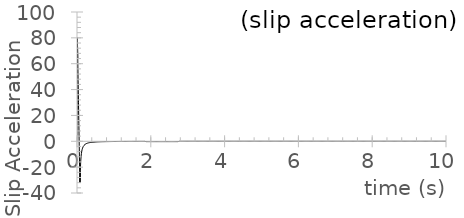
| Category | acceleration |
|---|---|
| 0.0 | 0 |
| 0.01 | 80.585 |
| 0.02 | 63.814 |
| 0.03 | 47.044 |
| 0.04 | 30.273 |
| 0.05 | 13.503 |
| 0.06 | -3.267 |
| 0.07 | -20.038 |
| 0.08 | -32.149 |
| 0.09 | -22.762 |
| 0.1 | -15.851 |
| 0.11 | -11.852 |
| 0.12 | -9.294 |
| 0.13 | -7.54 |
| 0.14 | -6.277 |
| 0.15 | -5.331 |
| 0.16 | -4.601 |
| 0.17 | -4.024 |
| 0.18 | -3.558 |
| 0.19 | -3.176 |
| 0.2 | -2.857 |
| 0.21 | -2.589 |
| 0.22 | -2.36 |
| 0.23 | -2.163 |
| 0.24 | -1.992 |
| 0.25 | -1.842 |
| 0.26 | -1.71 |
| 0.27 | -1.593 |
| 0.28 | -1.489 |
| 0.29 | -1.396 |
| 0.3 | -1.312 |
| 0.31 | -1.236 |
| 0.32 | -1.168 |
| 0.33 | -1.105 |
| 0.34 | -1.048 |
| 0.35 | -0.995 |
| 0.36 | -0.947 |
| 0.37 | -0.903 |
| 0.38 | -0.861 |
| 0.39 | -0.823 |
| 0.4 | -0.788 |
| 0.41 | -0.755 |
| 0.42 | -0.725 |
| 0.43 | -0.696 |
| 0.44 | -0.669 |
| 0.45 | -0.644 |
| 0.46 | -0.62 |
| 0.47 | -0.598 |
| 0.48 | -0.577 |
| 0.49 | -0.558 |
| 0.5 | -0.539 |
| 0.51 | -0.521 |
| 0.52 | -0.505 |
| 0.53 | -0.489 |
| 0.54 | -0.474 |
| 0.55 | -0.46 |
| 0.56 | -0.446 |
| 0.57 | -0.433 |
| 0.58 | -0.421 |
| 0.59 | -0.409 |
| 0.6 | -0.398 |
| 0.61 | -0.388 |
| 0.62 | -0.377 |
| 0.63 | -0.368 |
| 0.64 | -0.358 |
| 0.65 | -0.349 |
| 0.66 | -0.341 |
| 0.67 | -0.332 |
| 0.68 | -0.325 |
| 0.69 | -0.317 |
| 0.7 | -0.31 |
| 0.71 | -0.303 |
| 0.72 | -0.296 |
| 0.73 | -0.289 |
| 0.74 | -0.283 |
| 0.75 | -0.277 |
| 0.76 | -0.271 |
| 0.77 | -0.265 |
| 0.78 | -0.26 |
| 0.79 | -0.255 |
| 0.8 | -0.25 |
| 0.81 | -0.245 |
| 0.82 | -0.24 |
| 0.83 | -0.235 |
| 0.84 | -0.231 |
| 0.85 | -0.226 |
| 0.86 | -0.222 |
| 0.87 | -0.218 |
| 0.88 | -0.214 |
| 0.89 | -0.21 |
| 0.9 | -0.207 |
| 0.91 | -0.203 |
| 0.92 | -0.2 |
| 0.93 | -0.196 |
| 0.94 | -0.193 |
| 0.95 | -0.19 |
| 0.96 | -0.187 |
| 0.97 | -0.184 |
| 0.98 | -0.181 |
| 0.99 | -0.178 |
| 1.0 | -0.175 |
| 1.01 | -0.172 |
| 1.02 | -0.169 |
| 1.03 | -0.167 |
| 1.04 | -0.164 |
| 1.05 | -0.162 |
| 1.06 | -0.159 |
| 1.07 | -0.157 |
| 1.08 | -0.155 |
| 1.09 | -0.153 |
| 1.1 | -0.15 |
| 1.11 | -0.148 |
| 1.12 | -0.146 |
| 1.13 | -0.144 |
| 1.14 | -0.142 |
| 1.15 | -0.14 |
| 1.16 | -0.138 |
| 1.17 | -0.137 |
| 1.18 | -0.135 |
| 1.19 | -0.133 |
| 1.2 | -0.131 |
| 1.21 | -0.129 |
| 1.22 | -0.128 |
| 1.23 | -0.126 |
| 1.24 | -0.125 |
| 1.25 | -0.123 |
| 1.26 | -0.122 |
| 1.27 | -0.12 |
| 1.28 | -0.119 |
| 1.29 | -0.117 |
| 1.3 | -0.116 |
| 1.31 | -0.114 |
| 1.32 | -0.113 |
| 1.33 | -0.112 |
| 1.34 | -0.11 |
| 1.35 | -0.109 |
| 1.36 | -0.108 |
| 1.37 | -0.107 |
| 1.38 | -0.105 |
| 1.39 | -0.104 |
| 1.4 | -0.103 |
| 1.41 | -0.102 |
| 1.42 | -0.101 |
| 1.43 | -0.1 |
| 1.44 | -0.099 |
| 1.45 | -0.098 |
| 1.46 | -0.097 |
| 1.47 | -0.096 |
| 1.48 | -0.095 |
| 1.49 | -0.094 |
| 1.5 | -0.093 |
| 1.51 | -0.092 |
| 1.52 | -0.091 |
| 1.53 | -0.09 |
| 1.54 | -0.089 |
| 1.55 | -0.088 |
| 1.56 | -0.087 |
| 1.57 | -0.086 |
| 1.58 | -0.085 |
| 1.59 | -0.085 |
| 1.6 | -0.084 |
| 1.61 | -0.083 |
| 1.62 | -0.082 |
| 1.63 | -0.081 |
| 1.64 | -0.081 |
| 1.65 | -0.08 |
| 1.66 | -0.079 |
| 1.67 | -0.078 |
| 1.68 | -0.078 |
| 1.69 | -0.077 |
| 1.7 | -0.076 |
| 1.71 | -0.076 |
| 1.72 | -0.075 |
| 1.73 | -0.074 |
| 1.74 | -0.074 |
| 1.75 | -0.073 |
| 1.76 | -0.072 |
| 1.77 | -0.072 |
| 1.78 | -0.071 |
| 1.79 | -0.07 |
| 1.8 | -0.07 |
| 1.81 | -0.069 |
| 1.82 | -0.069 |
| 1.83 | -0.068 |
| 1.84 | -0.067 |
| 1.85 | -0.262 |
| 1.86 | -0.262 |
| 1.87 | -0.262 |
| 1.88 | -0.262 |
| 1.89 | -0.262 |
| 1.9 | -0.262 |
| 1.91 | -0.262 |
| 1.92 | -0.262 |
| 1.93 | -0.262 |
| 1.94 | -0.262 |
| 1.95 | -0.262 |
| 1.96 | -0.262 |
| 1.97 | -0.262 |
| 1.98 | -0.262 |
| 1.99 | -0.262 |
| 2.0 | -0.262 |
| 2.01 | -0.262 |
| 2.02 | -0.262 |
| 2.03 | -0.262 |
| 2.04 | -0.262 |
| 2.05 | -0.262 |
| 2.06 | -0.262 |
| 2.07 | -0.262 |
| 2.08 | -0.262 |
| 2.09 | -0.262 |
| 2.1 | -0.262 |
| 2.11 | -0.262 |
| 2.12 | -0.262 |
| 2.13 | -0.262 |
| 2.14 | -0.262 |
| 2.15 | -0.262 |
| 2.16 | -0.262 |
| 2.17 | -0.262 |
| 2.18 | -0.262 |
| 2.19 | -0.262 |
| 2.2 | -0.262 |
| 2.21 | -0.262 |
| 2.22 | -0.262 |
| 2.23 | -0.262 |
| 2.24 | -0.262 |
| 2.25 | -0.262 |
| 2.26 | -0.262 |
| 2.27 | -0.262 |
| 2.28 | -0.262 |
| 2.29 | -0.262 |
| 2.3 | -0.262 |
| 2.31 | -0.262 |
| 2.32 | -0.262 |
| 2.33 | -0.262 |
| 2.34 | -0.262 |
| 2.35 | -0.262 |
| 2.36 | -0.262 |
| 2.37 | -0.262 |
| 2.38 | -0.262 |
| 2.39 | -0.262 |
| 2.4 | -0.262 |
| 2.41 | -0.262 |
| 2.42 | -0.262 |
| 2.43 | -0.262 |
| 2.44 | -0.262 |
| 2.45 | -0.262 |
| 2.46 | -0.262 |
| 2.47 | -0.262 |
| 2.48 | -0.262 |
| 2.49 | -0.262 |
| 2.5 | -0.262 |
| 2.51 | -0.262 |
| 2.52 | -0.262 |
| 2.53 | -0.262 |
| 2.54 | -0.262 |
| 2.55 | -0.262 |
| 2.56 | -0.262 |
| 2.57 | -0.262 |
| 2.58 | -0.262 |
| 2.59 | -0.262 |
| 2.6 | -0.262 |
| 2.61 | -0.262 |
| 2.62 | -0.262 |
| 2.63 | -0.262 |
| 2.64 | -0.262 |
| 2.65 | -0.262 |
| 2.66 | -0.262 |
| 2.67 | -0.262 |
| 2.68 | -0.262 |
| 2.69 | -0.262 |
| 2.7 | -0.262 |
| 2.71 | -0.262 |
| 2.72 | -0.262 |
| 2.73 | -0.262 |
| 2.74 | -0.262 |
| 2.75 | -0.262 |
| 2.76 | -0.262 |
| 2.77 | 0 |
| 2.78 | 0 |
| 2.79 | 0 |
| 2.8 | 0 |
| 2.81 | 0 |
| 2.82 | 0 |
| 2.83 | 0 |
| 2.84 | 0 |
| 2.85 | 0 |
| 2.86 | 0 |
| 2.87 | 0 |
| 2.88 | 0 |
| 2.89 | 0 |
| 2.9 | 0 |
| 2.91 | 0 |
| 2.92 | 0 |
| 2.93 | 0 |
| 2.94 | 0 |
| 2.95 | 0 |
| 2.96 | 0 |
| 2.97 | 0 |
| 2.98 | 0 |
| 2.99 | 0 |
| 3.0 | 0 |
| 3.01 | 0 |
| 3.02 | 0 |
| 3.03 | 0 |
| 3.04 | 0 |
| 3.05 | 0 |
| 3.06 | 0 |
| 3.07 | 0 |
| 3.08 | 0 |
| 3.09 | 0 |
| 3.1 | 0 |
| 3.11 | 0 |
| 3.12 | 0 |
| 3.13 | 0 |
| 3.14 | 0 |
| 3.15 | 0 |
| 3.16 | 0 |
| 3.17 | 0 |
| 3.18 | 0 |
| 3.19 | 0 |
| 3.2 | 0 |
| 3.21 | 0 |
| 3.22 | 0 |
| 3.23 | 0 |
| 3.24 | 0 |
| 3.25 | 0 |
| 3.26 | 0 |
| 3.27 | 0 |
| 3.28 | 0 |
| 3.29 | 0 |
| 3.3 | 0 |
| 3.31 | 0 |
| 3.32 | 0 |
| 3.33 | 0 |
| 3.34 | 0 |
| 3.35 | 0 |
| 3.36 | 0 |
| 3.37 | 0 |
| 3.38 | 0 |
| 3.39 | 0 |
| 3.4 | 0 |
| 3.41 | 0 |
| 3.42 | 0 |
| 3.43 | 0 |
| 3.44 | 0 |
| 3.45 | 0 |
| 3.46 | 0 |
| 3.47 | 0 |
| 3.48 | 0 |
| 3.49 | 0 |
| 3.5 | 0 |
| 3.51 | 0 |
| 3.52 | 0 |
| 3.53 | 0 |
| 3.54 | 0 |
| 3.55 | 0 |
| 3.56 | 0 |
| 3.57 | 0 |
| 3.58 | 0 |
| 3.59 | 0 |
| 3.6 | 0 |
| 3.61 | 0 |
| 3.62 | 0 |
| 3.63 | 0 |
| 3.64 | 0 |
| 3.65 | 0 |
| 3.66 | 0 |
| 3.67 | 0 |
| 3.68 | 0 |
| 3.69 | 0 |
| 3.7 | 0 |
| 3.71 | 0 |
| 3.72 | 0 |
| 3.73 | 0 |
| 3.74 | 0 |
| 3.75 | 0 |
| 3.76 | 0 |
| 3.77 | 0 |
| 3.78 | 0 |
| 3.79 | 0 |
| 3.8 | 0 |
| 3.81 | 0 |
| 3.82 | 0 |
| 3.83 | 0 |
| 3.84 | 0 |
| 3.85 | 0 |
| 3.86 | 0 |
| 3.87 | 0 |
| 3.88 | 0 |
| 3.89 | 0 |
| 3.9 | 0 |
| 3.91 | 0 |
| 3.92 | 0 |
| 3.93 | 0 |
| 3.94 | 0 |
| 3.95 | 0 |
| 3.96 | 0 |
| 3.97 | 0 |
| 3.98 | 0 |
| 3.99 | 0 |
| 4.0 | 0 |
| 4.01 | 0 |
| 4.02 | 0 |
| 4.03 | 0 |
| 4.04 | 0 |
| 4.05 | 0 |
| 4.06 | 0 |
| 4.07 | 0 |
| 4.08 | 0 |
| 4.09 | 0 |
| 4.1 | 0 |
| 4.11 | 0 |
| 4.12 | 0 |
| 4.13 | 0 |
| 4.14 | 0 |
| 4.15 | 0 |
| 4.16 | 0 |
| 4.17 | 0 |
| 4.18 | 0 |
| 4.19 | 0 |
| 4.2 | 0 |
| 4.21 | 0 |
| 4.22 | 0 |
| 4.23 | 0 |
| 4.24 | 0 |
| 4.25 | 0 |
| 4.26 | 0 |
| 4.27 | 0 |
| 4.28 | 0 |
| 4.29 | 0 |
| 4.3 | 0 |
| 4.31 | 0 |
| 4.32 | 0 |
| 4.33 | 0 |
| 4.34 | 0 |
| 4.35 | 0 |
| 4.36 | 0 |
| 4.37 | 0 |
| 4.38 | 0 |
| 4.39 | 0 |
| 4.4 | 0 |
| 4.41 | 0 |
| 4.42 | 0 |
| 4.43 | 0 |
| 4.44 | 0 |
| 4.45 | 0 |
| 4.46 | 0 |
| 4.47 | 0 |
| 4.48 | 0 |
| 4.49 | 0 |
| 4.5 | 0 |
| 4.51 | 0 |
| 4.52 | 0 |
| 4.53 | 0 |
| 4.54 | 0 |
| 4.55 | 0 |
| 4.56 | 0 |
| 4.57 | 0 |
| 4.58 | 0 |
| 4.59 | 0 |
| 4.6 | 0 |
| 4.61 | 0 |
| 4.62 | 0 |
| 4.63 | 0 |
| 4.64 | 0 |
| 4.65 | 0 |
| 4.66 | 0 |
| 4.67 | 0 |
| 4.68 | 0 |
| 4.69 | 0 |
| 4.7 | 0 |
| 4.71 | 0 |
| 4.72 | 0 |
| 4.73 | 0 |
| 4.74 | 0 |
| 4.75 | 0 |
| 4.76 | 0 |
| 4.77 | 0 |
| 4.78 | 0 |
| 4.79 | 0 |
| 4.8 | 0 |
| 4.81 | 0 |
| 4.82 | 0 |
| 4.83 | 0 |
| 4.84 | 0 |
| 4.85 | 0 |
| 4.86 | 0 |
| 4.87 | 0 |
| 4.88 | 0 |
| 4.89 | 0 |
| 4.9 | 0 |
| 4.91 | 0 |
| 4.92 | 0 |
| 4.93 | 0 |
| 4.94 | 0 |
| 4.95 | 0 |
| 4.96 | 0 |
| 4.97 | 0 |
| 4.98 | 0 |
| 4.99 | 0 |
| 5.0 | 0 |
| 5.01 | 0 |
| 5.02 | 0 |
| 5.03 | 0 |
| 5.04 | 0 |
| 5.05 | 0 |
| 5.06 | 0 |
| 5.07 | 0 |
| 5.08 | 0 |
| 5.09 | 0 |
| 5.1 | 0 |
| 5.11 | 0 |
| 5.12 | 0 |
| 5.13 | 0 |
| 5.14 | 0 |
| 5.15 | 0 |
| 5.16 | 0 |
| 5.17 | 0 |
| 5.18 | 0 |
| 5.19 | 0 |
| 5.2 | 0 |
| 5.21 | 0 |
| 5.22 | 0 |
| 5.23 | 0 |
| 5.24 | 0 |
| 5.25 | 0 |
| 5.26 | 0 |
| 5.27 | 0 |
| 5.28 | 0 |
| 5.29 | 0 |
| 5.3 | 0 |
| 5.31 | 0 |
| 5.32 | 0 |
| 5.33 | 0 |
| 5.34 | 0 |
| 5.35 | 0 |
| 5.36 | 0 |
| 5.37 | 0 |
| 5.38 | 0 |
| 5.39 | 0 |
| 5.4 | 0 |
| 5.41 | 0 |
| 5.42 | 0 |
| 5.43 | 0 |
| 5.44 | 0 |
| 5.45 | 0 |
| 5.46 | 0 |
| 5.47 | 0 |
| 5.48 | 0 |
| 5.49 | 0 |
| 5.5 | 0 |
| 5.51 | 0 |
| 5.52 | 0 |
| 5.53 | 0 |
| 5.54 | 0 |
| 5.55 | 0 |
| 5.56 | 0 |
| 5.57 | 0 |
| 5.58 | 0 |
| 5.59 | 0 |
| 5.6 | 0 |
| 5.61 | 0 |
| 5.62 | 0 |
| 5.63 | 0 |
| 5.64 | 0 |
| 5.65 | 0 |
| 5.66 | 0 |
| 5.67 | 0 |
| 5.68 | 0 |
| 5.69 | 0 |
| 5.7 | 0 |
| 5.71 | 0 |
| 5.72 | 0 |
| 5.73 | 0 |
| 5.74 | 0 |
| 5.75 | 0 |
| 5.76 | 0 |
| 5.77 | 0 |
| 5.78 | 0 |
| 5.79 | 0 |
| 5.8 | 0 |
| 5.81 | 0 |
| 5.82 | 0 |
| 5.83 | 0 |
| 5.84 | 0 |
| 5.85 | 0 |
| 5.86 | 0 |
| 5.87 | 0 |
| 5.88 | 0 |
| 5.89 | 0 |
| 5.9 | 0 |
| 5.91 | 0 |
| 5.92 | 0 |
| 5.93 | 0 |
| 5.94 | 0 |
| 5.95 | 0 |
| 5.96 | 0 |
| 5.97 | 0 |
| 5.98 | 0 |
| 5.99 | 0 |
| 6.0 | 0 |
| 6.01 | 0 |
| 6.02 | 0 |
| 6.03 | 0 |
| 6.04 | 0 |
| 6.05 | 0 |
| 6.06 | 0 |
| 6.07 | 0 |
| 6.08 | 0 |
| 6.09 | 0 |
| 6.1 | 0 |
| 6.11 | 0 |
| 6.12 | 0 |
| 6.13 | 0 |
| 6.14 | 0 |
| 6.15 | 0 |
| 6.16 | 0 |
| 6.17 | 0 |
| 6.18 | 0 |
| 6.19 | 0 |
| 6.2 | 0 |
| 6.21 | 0 |
| 6.22 | 0 |
| 6.23 | 0 |
| 6.24 | 0 |
| 6.25 | 0 |
| 6.26 | 0 |
| 6.27 | 0 |
| 6.28 | 0 |
| 6.29 | 0 |
| 6.3 | 0 |
| 6.31 | 0 |
| 6.32 | 0 |
| 6.33 | 0 |
| 6.34 | 0 |
| 6.35 | 0 |
| 6.36 | 0 |
| 6.37 | 0 |
| 6.38 | 0 |
| 6.39 | 0 |
| 6.4 | 0 |
| 6.41 | 0 |
| 6.42 | 0 |
| 6.43 | 0 |
| 6.44 | 0 |
| 6.45 | 0 |
| 6.46 | 0 |
| 6.47 | 0 |
| 6.48 | 0 |
| 6.49 | 0 |
| 6.5 | 0 |
| 6.51 | 0 |
| 6.52 | 0 |
| 6.53 | 0 |
| 6.54 | 0 |
| 6.55 | 0 |
| 6.56 | 0 |
| 6.57 | 0 |
| 6.58 | 0 |
| 6.59 | 0 |
| 6.6 | 0 |
| 6.61 | 0 |
| 6.62 | 0 |
| 6.63 | 0 |
| 6.64 | 0 |
| 6.65 | 0 |
| 6.66 | 0 |
| 6.67 | 0 |
| 6.68 | 0 |
| 6.69 | 0 |
| 6.7 | 0 |
| 6.71 | 0 |
| 6.72 | 0 |
| 6.73 | 0 |
| 6.74 | 0 |
| 6.75 | 0 |
| 6.76 | 0 |
| 6.77 | 0 |
| 6.78 | 0 |
| 6.79 | 0 |
| 6.8 | 0 |
| 6.81 | 0 |
| 6.82 | 0 |
| 6.83 | 0 |
| 6.84 | 0 |
| 6.85 | 0 |
| 6.86 | 0 |
| 6.87 | 0 |
| 6.88 | 0 |
| 6.89 | 0 |
| 6.9 | 0 |
| 6.91 | 0 |
| 6.92 | 0 |
| 6.93 | 0 |
| 6.94 | 0 |
| 6.95 | 0 |
| 6.96 | 0 |
| 6.97 | 0 |
| 6.98 | 0 |
| 6.99 | 0 |
| 7.0 | 0 |
| 7.01 | 0 |
| 7.02 | 0 |
| 7.03 | 0 |
| 7.04 | 0 |
| 7.05 | 0 |
| 7.06 | 0 |
| 7.07 | 0 |
| 7.08 | 0 |
| 7.09 | 0 |
| 7.1 | 0 |
| 7.11 | 0 |
| 7.12 | 0 |
| 7.13 | 0 |
| 7.14 | 0 |
| 7.15 | 0 |
| 7.16 | 0 |
| 7.17 | 0 |
| 7.18 | 0 |
| 7.19 | 0 |
| 7.2 | 0 |
| 7.21 | 0 |
| 7.22 | 0 |
| 7.23 | 0 |
| 7.24 | 0 |
| 7.25 | 0 |
| 7.26 | 0 |
| 7.27 | 0 |
| 7.28 | 0 |
| 7.29 | 0 |
| 7.3 | 0 |
| 7.31 | 0 |
| 7.32 | 0 |
| 7.33 | 0 |
| 7.34 | 0 |
| 7.35 | 0 |
| 7.36 | 0 |
| 7.37 | 0 |
| 7.38 | 0 |
| 7.39 | 0 |
| 7.4 | 0 |
| 7.41 | 0 |
| 7.42 | 0 |
| 7.43 | 0 |
| 7.44 | 0 |
| 7.45 | 0 |
| 7.46 | 0 |
| 7.47 | 0 |
| 7.48 | 0 |
| 7.49 | 0 |
| 7.5 | 0 |
| 7.51 | 0 |
| 7.52 | 0 |
| 7.53 | 0 |
| 7.54 | 0 |
| 7.55 | 0 |
| 7.56 | 0 |
| 7.57 | 0 |
| 7.58 | 0 |
| 7.59 | 0 |
| 7.6 | 0 |
| 7.61 | 0 |
| 7.62 | 0 |
| 7.63 | 0 |
| 7.64 | 0 |
| 7.65 | 0 |
| 7.66 | 0 |
| 7.67 | 0 |
| 7.68 | 0 |
| 7.69 | 0 |
| 7.7 | 0 |
| 7.71 | 0 |
| 7.72 | 0 |
| 7.73 | 0 |
| 7.74 | 0 |
| 7.75 | 0 |
| 7.76 | 0 |
| 7.77 | 0 |
| 7.78 | 0 |
| 7.79 | 0 |
| 7.8 | 0 |
| 7.81 | 0 |
| 7.82 | 0 |
| 7.83 | 0 |
| 7.84 | 0 |
| 7.85 | 0 |
| 7.86 | 0 |
| 7.87 | 0 |
| 7.88 | 0 |
| 7.89 | 0 |
| 7.9 | 0 |
| 7.91 | 0 |
| 7.92 | 0 |
| 7.93 | 0 |
| 7.94 | 0 |
| 7.95 | 0 |
| 7.96 | 0 |
| 7.97 | 0 |
| 7.98 | 0 |
| 7.99 | 0 |
| 8.0 | 0 |
| 8.01 | 0 |
| 8.02 | 0 |
| 8.03 | 0 |
| 8.04 | 0 |
| 8.05 | 0 |
| 8.06 | 0 |
| 8.07 | 0 |
| 8.08 | 0 |
| 8.09 | 0 |
| 8.1 | 0 |
| 8.11 | 0 |
| 8.12 | 0 |
| 8.13 | 0 |
| 8.14 | 0 |
| 8.15 | 0 |
| 8.16 | 0 |
| 8.17 | 0 |
| 8.18 | 0 |
| 8.19 | 0 |
| 8.2 | 0 |
| 8.21 | 0 |
| 8.22 | 0 |
| 8.23 | 0 |
| 8.24 | 0 |
| 8.25 | 0 |
| 8.26 | 0 |
| 8.27 | 0 |
| 8.28 | 0 |
| 8.29 | 0 |
| 8.3 | 0 |
| 8.31 | 0 |
| 8.32 | 0 |
| 8.33 | 0 |
| 8.34 | 0 |
| 8.35 | 0 |
| 8.36 | 0 |
| 8.37 | 0 |
| 8.38 | 0 |
| 8.39 | 0 |
| 8.4 | 0 |
| 8.41 | 0 |
| 8.42 | 0 |
| 8.43 | 0 |
| 8.44 | 0 |
| 8.45 | 0 |
| 8.46 | 0 |
| 8.47 | 0 |
| 8.48 | 0 |
| 8.49 | 0 |
| 8.5 | 0 |
| 8.51 | 0 |
| 8.52 | 0 |
| 8.53 | 0 |
| 8.54 | 0 |
| 8.55 | 0 |
| 8.56 | 0 |
| 8.57 | 0 |
| 8.58 | 0 |
| 8.59 | 0 |
| 8.6 | 0 |
| 8.61 | 0 |
| 8.62 | 0 |
| 8.63 | 0 |
| 8.64 | 0 |
| 8.65 | 0 |
| 8.66 | 0 |
| 8.67 | 0 |
| 8.68 | 0 |
| 8.69 | 0 |
| 8.7 | 0 |
| 8.71 | 0 |
| 8.72 | 0 |
| 8.73 | 0 |
| 8.74 | 0 |
| 8.75 | 0 |
| 8.76 | 0 |
| 8.77 | 0 |
| 8.78 | 0 |
| 8.79 | 0 |
| 8.8 | 0 |
| 8.81 | 0 |
| 8.82 | 0 |
| 8.83 | 0 |
| 8.84 | 0 |
| 8.85 | 0 |
| 8.86 | 0 |
| 8.87 | 0 |
| 8.88 | 0 |
| 8.89 | 0 |
| 8.9 | 0 |
| 8.91 | 0 |
| 8.92 | 0 |
| 8.93 | 0 |
| 8.94 | 0 |
| 8.95 | 0 |
| 8.96 | 0 |
| 8.97 | 0 |
| 8.98 | 0 |
| 8.99 | 0 |
| 9.0 | 0 |
| 9.01 | 0 |
| 9.02 | 0 |
| 9.03 | 0 |
| 9.04 | 0 |
| 9.05 | 0 |
| 9.06 | 0 |
| 9.07 | 0 |
| 9.08 | 0 |
| 9.09 | 0 |
| 9.1 | 0 |
| 9.11 | 0 |
| 9.12 | 0 |
| 9.13 | 0 |
| 9.14 | 0 |
| 9.15 | 0 |
| 9.16 | 0 |
| 9.17 | 0 |
| 9.18 | 0 |
| 9.19 | 0 |
| 9.2 | 0 |
| 9.21 | 0 |
| 9.22 | 0 |
| 9.23 | 0 |
| 9.24 | 0 |
| 9.25 | 0 |
| 9.26 | 0 |
| 9.27 | 0 |
| 9.28 | 0 |
| 9.29 | 0 |
| 9.3 | 0 |
| 9.31 | 0 |
| 9.32 | 0 |
| 9.33 | 0 |
| 9.34 | 0 |
| 9.35 | 0 |
| 9.36 | 0 |
| 9.37 | 0 |
| 9.38 | 0 |
| 9.39 | 0 |
| 9.4 | 0 |
| 9.41 | 0 |
| 9.42 | 0 |
| 9.43 | 0 |
| 9.44 | 0 |
| 9.45 | 0 |
| 9.46 | 0 |
| 9.47 | 0 |
| 9.48 | 0 |
| 9.49 | 0 |
| 9.5 | 0 |
| 9.51 | 0 |
| 9.52 | 0 |
| 9.53 | 0 |
| 9.54 | 0 |
| 9.55 | 0 |
| 9.56 | 0 |
| 9.57 | 0 |
| 9.58 | 0 |
| 9.59 | 0 |
| 9.6 | 0 |
| 9.61 | 0 |
| 9.62 | 0 |
| 9.63 | 0 |
| 9.64 | 0 |
| 9.65 | 0 |
| 9.66 | 0 |
| 9.67 | 0 |
| 9.68 | 0 |
| 9.69 | 0 |
| 9.7 | 0 |
| 9.71 | 0 |
| 9.72 | 0 |
| 9.73 | 0 |
| 9.74 | 0 |
| 9.75 | 0 |
| 9.76 | 0 |
| 9.77 | 0 |
| 9.78 | 0 |
| 9.79 | 0 |
| 9.8 | 0 |
| 9.81 | 0 |
| 9.82 | 0 |
| 9.83 | 0 |
| 9.84 | 0 |
| 9.85 | 0 |
| 9.86 | 0 |
| 9.87 | 0 |
| 9.88 | 0 |
| 9.89 | 0 |
| 9.9 | 0 |
| 9.91 | 0 |
| 9.92 | 0 |
| 9.93 | 0 |
| 9.94 | 0 |
| 9.95 | 0 |
| 9.96 | 0 |
| 9.97 | 0 |
| 9.98 | 0 |
| 9.99 | 0 |
| 10.0 | 0 |
| 10.01 | 0 |
| 10.02 | 0 |
| 10.03 | 0 |
| 10.04 | 0 |
| 10.05 | 0 |
| 10.06 | 0 |
| 10.07 | 0 |
| 10.08 | 0 |
| 10.09 | 0 |
| 10.1 | 0 |
| 10.11 | 0 |
| 10.12 | 0 |
| 10.13 | 0 |
| 10.14 | 0 |
| 10.15 | 0 |
| 10.16 | 0 |
| 10.17 | 0 |
| 10.18 | 0 |
| 10.19 | 0 |
| 10.2 | 0 |
| 10.21 | 0 |
| 10.22 | 0 |
| 10.23 | 0 |
| 10.24 | 0 |
| 10.25 | 0 |
| 10.26 | 0 |
| 10.27 | 0 |
| 10.28 | 0 |
| 10.29 | 0 |
| 10.3 | 0 |
| 10.31 | 0 |
| 10.32 | 0 |
| 10.33 | 0 |
| 10.34 | 0 |
| 10.35 | 0 |
| 10.36 | 0 |
| 10.37 | 0 |
| 10.38 | 0 |
| 10.39 | 0 |
| 10.4 | 0 |
| 10.41 | 0 |
| 10.42 | 0 |
| 10.43 | 0 |
| 10.44 | 0 |
| 10.45 | 0 |
| 10.46 | 0 |
| 10.47 | 0 |
| 10.48 | 0 |
| 10.49 | 0 |
| 10.5 | 0 |
| 10.51 | 0 |
| 10.52 | 0 |
| 10.53 | 0 |
| 10.54 | 0 |
| 10.55 | 0 |
| 10.56 | 0 |
| 10.57 | 0 |
| 10.58 | 0 |
| 10.59 | 0 |
| 10.6 | 0 |
| 10.61 | 0 |
| 10.62 | 0 |
| 10.63 | 0 |
| 10.64 | 0 |
| 10.65 | 0 |
| 10.66 | 0 |
| 10.67 | 0 |
| 10.68 | 0 |
| 10.69 | 0 |
| 10.7 | 0 |
| 10.71 | 0 |
| 10.72 | 0 |
| 10.73 | 0 |
| 10.74 | 0 |
| 10.75 | 0 |
| 10.76 | 0 |
| 10.77 | 0 |
| 10.78 | 0 |
| 10.79 | 0 |
| 10.8 | 0 |
| 10.81 | 0 |
| 10.82 | 0 |
| 10.83 | 0 |
| 10.84 | 0 |
| 10.85 | 0 |
| 10.86 | 0 |
| 10.87 | 0 |
| 10.88 | 0 |
| 10.89 | 0 |
| 10.9 | 0 |
| 10.91 | 0 |
| 10.92 | 0 |
| 10.93 | 0 |
| 10.94 | 0 |
| 10.95 | 0 |
| 10.96 | 0 |
| 10.97 | 0 |
| 10.98 | 0 |
| 10.99 | 0 |
| 11.0 | 0 |
| 11.01 | 0 |
| 11.02 | 0 |
| 11.03 | 0 |
| 11.04 | 0 |
| 11.05 | 0 |
| 11.06 | 0 |
| 11.07 | 0 |
| 11.08 | 0 |
| 11.09 | 0 |
| 11.1 | 0 |
| 11.11 | 0 |
| 11.12 | 0 |
| 11.13 | 0 |
| 11.14 | 0 |
| 11.15 | 0 |
| 11.16 | 0 |
| 11.17 | 0 |
| 11.18 | 0 |
| 11.19 | 0 |
| 11.2 | 0 |
| 11.21 | 0 |
| 11.22 | 0 |
| 11.23 | 0 |
| 11.24 | 0 |
| 11.25 | 0 |
| 11.26 | 0 |
| 11.27 | 0 |
| 11.28 | 0 |
| 11.29 | 0 |
| 11.3 | 0 |
| 11.31 | 0 |
| 11.32 | 0 |
| 11.33 | 0 |
| 11.34 | 0 |
| 11.35 | 0 |
| 11.36 | 0 |
| 11.37 | 0 |
| 11.38 | 0 |
| 11.39 | 0 |
| 11.4 | 0 |
| 11.41 | 0 |
| 11.42 | 0 |
| 11.43 | 0 |
| 11.44 | 0 |
| 11.45 | 0 |
| 11.46 | 0 |
| 11.47 | 0 |
| 11.48 | 0 |
| 11.49 | 0 |
| 11.5 | 0 |
| 11.51 | 0 |
| 11.52 | 0 |
| 11.53 | 0 |
| 11.54 | 0 |
| 11.55 | 0 |
| 11.56 | 0 |
| 11.57 | 0 |
| 11.58 | 0 |
| 11.59 | 0 |
| 11.6 | 0 |
| 11.61 | 0 |
| 11.62 | 0 |
| 11.63 | 0 |
| 11.64 | 0 |
| 11.65 | 0 |
| 11.66 | 0 |
| 11.67 | 0 |
| 11.68 | 0 |
| 11.69 | 0 |
| 11.7 | 0 |
| 11.71 | 0 |
| 11.72 | 0 |
| 11.73 | 0 |
| 11.74 | 0 |
| 11.75 | 0 |
| 11.76 | 0 |
| 11.77 | 0 |
| 11.78 | 0 |
| 11.79 | 0 |
| 11.8 | 0 |
| 11.81 | 0 |
| 11.82 | 0 |
| 11.83 | 0 |
| 11.84 | 0 |
| 11.85 | 0 |
| 11.86 | 0 |
| 11.87 | 0 |
| 11.88 | 0 |
| 11.89 | 0 |
| 11.9 | 0 |
| 11.91 | 0 |
| 11.92 | 0 |
| 11.93 | 0 |
| 11.94 | 0 |
| 11.95 | 0 |
| 11.96 | 0 |
| 11.97 | 0 |
| 11.98 | 0 |
| 11.99 | 0 |
| 12.0 | 0 |
| 12.01 | 0 |
| 12.02 | 0 |
| 12.03 | 0 |
| 12.04 | 0 |
| 12.05 | 0 |
| 12.06 | 0 |
| 12.07 | 0 |
| 12.08 | 0 |
| 12.09 | 0 |
| 12.1 | 0 |
| 12.11 | 0 |
| 12.12 | 0 |
| 12.13 | 0 |
| 12.14 | 0 |
| 12.15 | 0 |
| 12.16 | 0 |
| 12.17 | 0 |
| 12.18 | 0 |
| 12.19 | 0 |
| 12.2 | 0 |
| 12.21 | 0 |
| 12.22 | 0 |
| 12.23 | 0 |
| 12.24 | 0 |
| 12.25 | 0 |
| 12.26 | 0 |
| 12.27 | 0 |
| 12.28 | 0 |
| 12.29 | 0 |
| 12.3 | 0 |
| 12.31 | 0 |
| 12.32 | 0 |
| 12.33 | 0 |
| 12.34 | 0 |
| 12.35 | 0 |
| 12.36 | 0 |
| 12.37 | 0 |
| 12.38 | 0 |
| 12.39 | 0 |
| 12.4 | 0 |
| 12.41 | 0 |
| 12.42 | 0 |
| 12.43 | 0 |
| 12.44 | 0 |
| 12.45 | 0 |
| 12.46 | 0 |
| 12.47 | 0 |
| 12.48 | 0 |
| 12.49 | 0 |
| 12.5 | 0 |
| 12.51 | 0 |
| 12.52 | 0 |
| 12.53 | 0 |
| 12.54 | 0 |
| 12.55 | 0 |
| 12.56 | 0 |
| 12.57 | 0 |
| 12.58 | 0 |
| 12.59 | 0 |
| 12.6 | 0 |
| 12.61 | 0 |
| 12.62 | 0 |
| 12.63 | 0 |
| 12.64 | 0 |
| 12.65 | 0 |
| 12.66 | 0 |
| 12.67 | 0 |
| 12.68 | 0 |
| 12.69 | 0 |
| 12.7 | 0 |
| 12.71 | 0 |
| 12.72 | 0 |
| 12.73 | 0 |
| 12.74 | 0 |
| 12.75 | 0 |
| 12.76 | 0 |
| 12.77 | 0 |
| 12.78 | 0 |
| 12.79 | 0 |
| 12.8 | 0 |
| 12.81 | 0 |
| 12.82 | 0 |
| 12.83 | 0 |
| 12.84 | 0 |
| 12.85 | 0 |
| 12.86 | 0 |
| 12.87 | 0 |
| 12.88 | 0 |
| 12.89 | 0 |
| 12.9 | 0 |
| 12.91 | 0 |
| 12.92 | 0 |
| 12.93 | 0 |
| 12.94 | 0 |
| 12.95 | 0 |
| 12.96 | 0 |
| 12.97 | 0 |
| 12.98 | 0 |
| 12.99 | 0 |
| 13.0 | 0 |
| 13.01 | 0 |
| 13.02 | 0 |
| 13.03 | 0 |
| 13.04 | 0 |
| 13.05 | 0 |
| 13.06 | 0 |
| 13.07 | 0 |
| 13.08 | 0 |
| 13.09 | 0 |
| 13.1 | 0 |
| 13.11 | 0 |
| 13.12 | 0 |
| 13.13 | 0 |
| 13.14 | 0 |
| 13.15 | 0 |
| 13.16 | 0 |
| 13.17 | 0 |
| 13.18 | 0 |
| 13.19 | 0 |
| 13.2 | 0 |
| 13.21 | 0 |
| 13.22 | 0 |
| 13.23 | 0 |
| 13.24 | 0 |
| 13.25 | 0 |
| 13.26 | 0 |
| 13.27 | 0 |
| 13.28 | 0 |
| 13.29 | 0 |
| 13.3 | 0 |
| 13.31 | 0 |
| 13.32 | 0 |
| 13.33 | 0 |
| 13.34 | 0 |
| 13.35 | 0 |
| 13.36 | 0 |
| 13.37 | 0 |
| 13.38 | 0 |
| 13.39 | 0 |
| 13.4 | 0 |
| 13.41 | 0 |
| 13.42 | 0 |
| 13.43 | 0 |
| 13.44 | 0 |
| 13.45 | 0 |
| 13.46 | 0 |
| 13.47 | 0 |
| 13.48 | 0 |
| 13.49 | 0 |
| 13.5 | 0 |
| 13.51 | 0 |
| 13.52 | 0 |
| 13.53 | 0 |
| 13.54 | 0 |
| 13.55 | 0 |
| 13.56 | 0 |
| 13.57 | 0 |
| 13.58 | 0 |
| 13.59 | 0 |
| 13.6 | 0 |
| 13.61 | 0 |
| 13.62 | 0 |
| 13.63 | 0 |
| 13.64 | 0 |
| 13.65 | 0 |
| 13.66 | 0 |
| 13.67 | 0 |
| 13.68 | 0 |
| 13.69 | 0 |
| 13.7 | 0 |
| 13.71 | 0 |
| 13.72 | 0 |
| 13.73 | 0 |
| 13.74 | 0 |
| 13.75 | 0 |
| 13.76 | 0 |
| 13.77 | 0 |
| 13.78 | 0 |
| 13.79 | 0 |
| 13.8 | 0 |
| 13.81 | 0 |
| 13.82 | 0 |
| 13.83 | 0 |
| 13.84 | 0 |
| 13.85 | 0 |
| 13.86 | 0 |
| 13.87 | 0 |
| 13.88 | 0 |
| 13.89 | 0 |
| 13.9 | 0 |
| 13.91 | 0 |
| 13.92 | 0 |
| 13.93 | 0 |
| 13.94 | 0 |
| 13.95 | 0 |
| 13.96 | 0 |
| 13.97 | 0 |
| 13.98 | 0 |
| 13.99 | 0 |
| 14.0 | 0 |
| 14.01 | 0 |
| 14.02 | 0 |
| 14.03 | 0 |
| 14.04 | 0 |
| 14.05 | 0 |
| 14.06 | 0 |
| 14.07 | 0 |
| 14.08 | 0 |
| 14.09 | 0 |
| 14.1 | 0 |
| 14.11 | 0 |
| 14.12 | 0 |
| 14.13 | 0 |
| 14.14 | 0 |
| 14.15 | 0 |
| 14.16 | 0 |
| 14.17 | 0 |
| 14.18 | 0 |
| 14.19 | 0 |
| 14.2 | 0 |
| 14.21 | 0 |
| 14.22 | 0 |
| 14.23 | 0 |
| 14.24 | 0 |
| 14.25 | 0 |
| 14.26 | 0 |
| 14.27 | 0 |
| 14.28 | 0 |
| 14.29 | 0 |
| 14.3 | 0 |
| 14.31 | 0 |
| 14.32 | 0 |
| 14.33 | 0 |
| 14.34 | 0 |
| 14.35 | 0 |
| 14.36 | 0 |
| 14.37 | 0 |
| 14.38 | 0 |
| 14.39 | 0 |
| 14.4 | 0 |
| 14.41 | 0 |
| 14.42 | 0 |
| 14.43 | 0 |
| 14.44 | 0 |
| 14.45 | 0 |
| 14.46 | 0 |
| 14.47 | 0 |
| 14.48 | 0 |
| 14.49 | 0 |
| 14.5 | 0 |
| 14.51 | 0 |
| 14.52 | 0 |
| 14.53 | 0 |
| 14.54 | 0 |
| 14.55 | 0 |
| 14.56 | 0 |
| 14.57 | 0 |
| 14.58 | 0 |
| 14.59 | 0 |
| 14.6 | 0 |
| 14.61 | 0 |
| 14.62 | 0 |
| 14.63 | 0 |
| 14.64 | 0 |
| 14.65 | 0 |
| 14.66 | 0 |
| 14.67 | 0 |
| 14.68 | 0 |
| 14.69 | 0 |
| 14.7 | 0 |
| 14.71 | 0 |
| 14.72 | 0 |
| 14.73 | 0 |
| 14.74 | 0 |
| 14.75 | 0 |
| 14.76 | 0 |
| 14.77 | 0 |
| 14.78 | 0 |
| 14.79 | 0 |
| 14.8 | 0 |
| 14.81 | 0 |
| 14.82 | 0 |
| 14.83 | 0 |
| 14.84 | 0 |
| 14.85 | 0 |
| 14.86 | 0 |
| 14.87 | 0 |
| 14.88 | 0 |
| 14.89 | 0 |
| 14.9 | 0 |
| 14.91 | 0 |
| 14.92 | 0 |
| 14.93 | 0 |
| 14.94 | 0 |
| 14.95 | 0 |
| 14.96 | 0 |
| 14.97 | 0 |
| 14.98 | 0 |
| 14.99 | 0 |
| 15.0 | 0 |
| 15.01 | 0 |
| 15.02 | 0 |
| 15.03 | 0 |
| 15.04 | 0 |
| 15.05 | 0 |
| 15.06 | 0 |
| 15.07 | 0 |
| 15.08 | 0 |
| 15.09 | 0 |
| 15.1 | 0 |
| 15.11 | 0 |
| 15.12 | 0 |
| 15.13 | 0 |
| 15.14 | 0 |
| 15.15 | 0 |
| 15.16 | 0 |
| 15.17 | 0 |
| 15.18 | 0 |
| 15.19 | 0 |
| 15.2 | 0 |
| 15.21 | 0 |
| 15.22 | 0 |
| 15.23 | 0 |
| 15.24 | 0 |
| 15.25 | 0 |
| 15.26 | 0 |
| 15.27 | 0 |
| 15.28 | 0 |
| 15.29 | 0 |
| 15.3 | 0 |
| 15.31 | 0 |
| 15.32 | 0 |
| 15.33 | 0 |
| 15.34 | 0 |
| 15.35 | 0 |
| 15.36 | 0 |
| 15.37 | 0 |
| 15.38 | 0 |
| 15.39 | 0 |
| 15.4 | 0 |
| 15.41 | 0 |
| 15.42 | 0 |
| 15.43 | 0 |
| 15.44 | 0 |
| 15.45 | 0 |
| 15.46 | 0 |
| 15.47 | 0 |
| 15.48 | 0 |
| 15.49 | 0 |
| 15.5 | 0 |
| 15.51 | 0 |
| 15.52 | 0 |
| 15.53 | 0 |
| 15.54 | 0 |
| 15.55 | 0 |
| 15.56 | 0 |
| 15.57 | 0 |
| 15.58 | 0 |
| 15.59 | 0 |
| 15.6 | 0 |
| 15.61 | 0 |
| 15.62 | 0 |
| 15.63 | 0 |
| 15.64 | 0 |
| 15.65 | 0 |
| 15.66 | 0 |
| 15.67 | 0 |
| 15.68 | 0 |
| 15.69 | 0 |
| 15.7 | 0 |
| 15.71 | 0 |
| 15.72 | 0 |
| 15.73 | 0 |
| 15.74 | 0 |
| 15.75 | 0 |
| 15.76 | 0 |
| 15.77 | 0 |
| 15.78 | 0 |
| 15.79 | 0 |
| 15.8 | 0 |
| 15.81 | 0 |
| 15.82 | 0 |
| 15.83 | 0 |
| 15.84 | 0 |
| 15.85 | 0 |
| 15.86 | 0 |
| 15.87 | 0 |
| 15.88 | 0 |
| 15.89 | 0 |
| 15.9 | 0 |
| 15.91 | 0 |
| 15.92 | 0 |
| 15.93 | 0 |
| 15.94 | 0 |
| 15.95 | 0 |
| 15.96 | 0 |
| 15.97 | 0 |
| 15.98 | 0 |
| 15.99 | 0 |
| 16.0 | 0 |
| 16.01 | 0 |
| 16.02 | 0 |
| 16.03 | 0 |
| 16.04 | 0 |
| 16.05 | 0 |
| 16.06 | 0 |
| 16.07 | 0 |
| 16.08 | 0 |
| 16.09 | 0 |
| 16.1 | 0 |
| 16.11 | 0 |
| 16.12 | 0 |
| 16.13 | 0 |
| 16.14 | 0 |
| 16.15 | 0 |
| 16.16 | 0 |
| 16.17 | 0 |
| 16.18 | 0 |
| 16.19 | 0 |
| 16.2 | 0 |
| 16.21 | 0 |
| 16.22 | 0 |
| 16.23 | 0 |
| 16.24 | 0 |
| 16.25 | 0 |
| 16.26 | 0 |
| 16.27 | 0 |
| 16.28 | 0 |
| 16.29 | 0 |
| 16.3 | 0 |
| 16.31 | 0 |
| 16.32 | 0 |
| 16.33 | 0 |
| 16.34 | 0 |
| 16.35 | 0 |
| 16.36 | 0 |
| 16.37 | 0 |
| 16.38 | 0 |
| 16.39 | 0 |
| 16.4 | 0 |
| 16.41 | 0 |
| 16.42 | 0 |
| 16.43 | 0 |
| 16.44 | 0 |
| 16.45 | 0 |
| 16.46 | 0 |
| 16.47 | 0 |
| 16.48 | 0 |
| 16.49 | 0 |
| 16.5 | 0 |
| 16.51 | 0 |
| 16.52 | 0 |
| 16.53 | 0 |
| 16.54 | 0 |
| 16.55 | 0 |
| 16.56 | 0 |
| 16.57 | 0 |
| 16.58 | 0 |
| 16.59 | 0 |
| 16.6 | 0 |
| 16.61 | 0 |
| 16.62 | 0 |
| 16.63 | 0 |
| 16.64 | 0 |
| 16.65 | 0 |
| 16.66 | 0 |
| 16.67 | 0 |
| 16.68 | 0 |
| 16.69 | 0 |
| 16.7 | 0 |
| 16.71 | 0 |
| 16.72 | 0 |
| 16.73 | 0 |
| 16.74 | 0 |
| 16.75 | 0 |
| 16.76 | 0 |
| 16.77 | 0 |
| 16.78 | 0 |
| 16.79 | 0 |
| 16.8 | 0 |
| 16.81 | 0 |
| 16.82 | 0 |
| 16.83 | 0 |
| 16.84 | 0 |
| 16.85 | 0 |
| 16.86 | 0 |
| 16.87 | 0 |
| 16.88 | 0 |
| 16.89 | 0 |
| 16.9 | 0 |
| 16.91 | 0 |
| 16.92 | 0 |
| 16.93 | 0 |
| 16.94 | 0 |
| 16.95 | 0 |
| 16.96 | 0 |
| 16.97 | 0 |
| 16.98 | 0 |
| 16.99 | 0 |
| 17.0 | 0 |
| 17.01 | 0 |
| 17.02 | 0 |
| 17.03 | 0 |
| 17.04 | 0 |
| 17.05 | 0 |
| 17.06 | 0 |
| 17.07 | 0 |
| 17.08 | 0 |
| 17.09 | 0 |
| 17.1 | 0 |
| 17.11 | 0 |
| 17.12 | 0 |
| 17.13 | 0 |
| 17.14 | 0 |
| 17.15 | 0 |
| 17.16 | 0 |
| 17.17 | 0 |
| 17.18 | 0 |
| 17.19 | 0 |
| 17.2 | 0 |
| 17.21 | 0 |
| 17.22 | 0 |
| 17.23 | 0 |
| 17.24 | 0 |
| 17.25 | 0 |
| 17.26 | 0 |
| 17.27 | 0 |
| 17.28 | 0 |
| 17.29 | 0 |
| 17.3 | 0 |
| 17.31 | 0 |
| 17.32 | 0 |
| 17.33 | 0 |
| 17.34 | 0 |
| 17.35 | 0 |
| 17.36 | 0 |
| 17.37 | 0 |
| 17.38 | 0 |
| 17.39 | 0 |
| 17.4 | 0 |
| 17.41 | 0 |
| 17.42 | 0 |
| 17.43 | 0 |
| 17.44 | 0 |
| 17.45 | 0 |
| 17.46 | 0 |
| 17.47 | 0 |
| 17.48 | 0 |
| 17.49 | 0 |
| 17.5 | 0 |
| 17.51 | 0 |
| 17.52 | 0 |
| 17.53 | 0 |
| 17.54 | 0 |
| 17.55 | 0 |
| 17.56 | 0 |
| 17.57 | 0 |
| 17.58 | 0 |
| 17.59 | 0 |
| 17.6 | 0 |
| 17.61 | 0 |
| 17.62 | 0 |
| 17.63 | 0 |
| 17.64 | 0 |
| 17.65 | 0 |
| 17.66 | 0 |
| 17.67 | 0 |
| 17.68 | 0 |
| 17.69 | 0 |
| 17.7 | 0 |
| 17.71 | 0 |
| 17.72 | 0 |
| 17.73 | 0 |
| 17.74 | 0 |
| 17.75 | 0 |
| 17.76 | 0 |
| 17.77 | 0 |
| 17.78 | 0 |
| 17.79 | 0 |
| 17.8 | 0 |
| 17.81 | 0 |
| 17.82 | 0 |
| 17.83 | 0 |
| 17.84 | 0 |
| 17.85 | 0 |
| 17.86 | 0 |
| 17.87 | 0 |
| 17.88 | 0 |
| 17.89 | 0 |
| 17.9 | 0 |
| 17.91 | 0 |
| 17.92 | 0 |
| 17.93 | 0 |
| 17.94 | 0 |
| 17.95 | 0 |
| 17.96 | 0 |
| 17.97 | 0 |
| 17.98 | 0 |
| 17.99 | 0 |
| 18.0 | 0 |
| 18.01 | 0 |
| 18.02 | 0 |
| 18.03 | 0 |
| 18.04 | 0 |
| 18.05 | 0 |
| 18.06 | 0 |
| 18.07 | 0 |
| 18.08 | 0 |
| 18.09 | 0 |
| 18.1 | 0 |
| 18.11 | 0 |
| 18.12 | 0 |
| 18.13 | 0 |
| 18.14 | 0 |
| 18.15 | 0 |
| 18.16 | 0 |
| 18.17 | 0 |
| 18.18 | 0 |
| 18.19 | 0 |
| 18.2 | 0 |
| 18.21 | 0 |
| 18.22 | 0 |
| 18.23 | 0 |
| 18.24 | 0 |
| 18.25 | 0 |
| 18.26 | 0 |
| 18.27 | 0 |
| 18.28 | 0 |
| 18.29 | 0 |
| 18.3 | 0 |
| 18.31 | 0 |
| 18.32 | 0 |
| 18.33 | 0 |
| 18.34 | 0 |
| 18.35 | 0 |
| 18.36 | 0 |
| 18.37 | 0 |
| 18.38 | 0 |
| 18.39 | 0 |
| 18.4 | 0 |
| 18.41 | 0 |
| 18.42 | 0 |
| 18.43 | 0 |
| 18.44 | 0 |
| 18.45 | 0 |
| 18.46 | 0 |
| 18.47 | 0 |
| 18.48 | 0 |
| 18.49 | 0 |
| 18.5 | 0 |
| 18.51 | 0 |
| 18.52 | 0 |
| 18.53 | 0 |
| 18.54 | 0 |
| 18.55 | 0 |
| 18.56 | 0 |
| 18.57 | 0 |
| 18.58 | 0 |
| 18.59 | 0 |
| 18.6 | 0 |
| 18.61 | 0 |
| 18.62 | 0 |
| 18.63 | 0 |
| 18.64 | 0 |
| 18.65 | 0 |
| 18.66 | 0 |
| 18.67 | 0 |
| 18.68 | 0 |
| 18.69 | 0 |
| 18.7 | 0 |
| 18.71 | 0 |
| 18.72 | 0 |
| 18.73 | 0 |
| 18.74 | 0 |
| 18.75 | 0 |
| 18.76 | 0 |
| 18.77 | 0 |
| 18.78 | 0 |
| 18.79 | 0 |
| 18.8 | 0 |
| 18.81 | 0 |
| 18.82 | 0 |
| 18.83 | 0 |
| 18.84 | 0 |
| 18.85 | 0 |
| 18.86 | 0 |
| 18.87 | 0 |
| 18.88 | 0 |
| 18.89 | 0 |
| 18.9 | 0 |
| 18.91 | 0 |
| 18.92 | 0 |
| 18.93 | 0 |
| 18.94 | 0 |
| 18.95 | 0 |
| 18.96 | 0 |
| 18.97 | 0 |
| 18.98 | 0 |
| 18.99 | 0 |
| 19.0 | 0 |
| 19.01 | 0 |
| 19.02 | 0 |
| 19.03 | 0 |
| 19.04 | 0 |
| 19.05 | 0 |
| 19.06 | 0 |
| 19.07 | 0 |
| 19.08 | 0 |
| 19.09 | 0 |
| 19.1 | 0 |
| 19.11 | 0 |
| 19.12 | 0 |
| 19.13 | 0 |
| 19.14 | 0 |
| 19.15 | 0 |
| 19.16 | 0 |
| 19.17 | 0 |
| 19.18 | 0 |
| 19.19 | 0 |
| 19.2 | 0 |
| 19.21 | 0 |
| 19.22 | 0 |
| 19.23 | 0 |
| 19.24 | 0 |
| 19.25 | 0 |
| 19.26 | 0 |
| 19.27 | 0 |
| 19.28 | 0 |
| 19.29 | 0 |
| 19.3 | 0 |
| 19.31 | 0 |
| 19.32 | 0 |
| 19.33 | 0 |
| 19.34 | 0 |
| 19.35 | 0 |
| 19.36 | 0 |
| 19.37 | 0 |
| 19.38 | 0 |
| 19.39 | 0 |
| 19.4 | 0 |
| 19.41 | 0 |
| 19.42 | 0 |
| 19.43 | 0 |
| 19.44 | 0 |
| 19.45 | 0 |
| 19.46 | 0 |
| 19.47 | 0 |
| 19.48 | 0 |
| 19.49 | 0 |
| 19.5 | 0 |
| 19.51 | 0 |
| 19.52 | 0 |
| 19.53 | 0 |
| 19.54 | 0 |
| 19.55 | 0 |
| 19.56 | 0 |
| 19.57 | 0 |
| 19.58 | 0 |
| 19.59 | 0 |
| 19.6 | 0 |
| 19.61 | 0 |
| 19.62 | 0 |
| 19.63 | 0 |
| 19.64 | 0 |
| 19.65 | 0 |
| 19.66 | 0 |
| 19.67 | 0 |
| 19.68 | 0 |
| 19.69 | 0 |
| 19.7 | 0 |
| 19.71 | 0 |
| 19.72 | 0 |
| 19.73 | 0 |
| 19.74 | 0 |
| 19.75 | 0 |
| 19.76 | 0 |
| 19.77 | 0 |
| 19.78 | 0 |
| 19.79 | 0 |
| 19.8 | 0 |
| 19.81 | 0 |
| 19.82 | 0 |
| 19.83 | 0 |
| 19.84 | 0 |
| 19.85 | 0 |
| 19.86 | 0 |
| 19.87 | 0 |
| 19.88 | 0 |
| 19.89 | 0 |
| 19.9 | 0 |
| 19.91 | 0 |
| 19.92 | 0 |
| 19.93 | 0 |
| 19.94 | 0 |
| 19.95 | 0 |
| 19.96 | 0 |
| 19.97 | 0 |
| 19.98 | 0 |
| 19.99 | 0 |
| 20.0 | 0 |
| 20.01 | 0 |
| 20.02 | 0 |
| 20.03 | 0 |
| 20.04 | 0 |
| 20.05 | 0 |
| 20.06 | 0 |
| 20.07 | 0 |
| 20.08 | 0 |
| 20.09 | 0 |
| 20.1 | 0 |
| 20.11 | 0 |
| 20.12 | 0 |
| 20.13 | 0 |
| 20.14 | 0 |
| 20.15 | 0 |
| 20.16 | 0 |
| 20.17 | 0 |
| 20.18 | 0 |
| 20.19 | 0 |
| 20.2 | 0 |
| 20.21 | 0 |
| 20.22 | 0 |
| 20.23 | 0 |
| 20.24 | 0 |
| 20.25 | 0 |
| 20.26 | 0 |
| 20.27 | 0 |
| 20.28 | 0 |
| 20.29 | 0 |
| 20.3 | 0 |
| 20.31 | 0 |
| 20.32 | 0 |
| 20.33 | 0 |
| 20.34 | 0 |
| 20.35 | 0 |
| 20.36 | 0 |
| 20.37 | 0 |
| 20.38 | 0 |
| 20.39 | 0 |
| 20.4 | 0 |
| 20.41 | 0 |
| 20.42 | 0 |
| 20.43 | 0 |
| 20.44 | 0 |
| 20.45 | 0 |
| 20.46 | 0 |
| 20.47 | 0 |
| 20.48 | 0 |
| 20.49 | 0 |
| 20.5 | 0 |
| 20.51 | 0 |
| 20.52 | 0 |
| 20.53 | 0 |
| 20.54 | 0 |
| 20.55 | 0 |
| 20.56 | 0 |
| 20.57 | 0 |
| 20.58 | 0 |
| 20.59 | 0 |
| 20.6 | 0 |
| 20.61 | 0 |
| 20.62 | 0 |
| 20.63 | 0 |
| 20.64 | 0 |
| 20.65 | 0 |
| 20.66 | 0 |
| 20.67 | 0 |
| 20.68 | 0 |
| 20.69 | 0 |
| 20.7 | 0 |
| 20.71 | 0 |
| 20.72 | 0 |
| 20.73 | 0 |
| 20.74 | 0 |
| 20.75 | 0 |
| 20.76 | 0 |
| 20.77 | 0 |
| 20.78 | 0 |
| 20.79 | 0 |
| 20.8 | 0 |
| 20.81 | 0 |
| 20.82 | 0 |
| 20.83 | 0 |
| 20.84 | 0 |
| 20.85 | 0 |
| 20.86 | 0 |
| 20.87 | 0 |
| 20.88 | 0 |
| 20.89 | 0 |
| 20.9 | 0 |
| 20.91 | 0 |
| 20.92 | 0 |
| 20.93 | 0 |
| 20.94 | 0 |
| 20.95 | 0 |
| 20.96 | 0 |
| 20.97 | 0 |
| 20.98 | 0 |
| 20.99 | 0 |
| 21.0 | 0 |
| 21.01 | 0 |
| 21.02 | 0 |
| 21.03 | 0 |
| 21.04 | 0 |
| 21.05 | 0 |
| 21.06 | 0 |
| 21.07 | 0 |
| 21.08 | 0 |
| 21.09 | 0 |
| 21.1 | 0 |
| 21.11 | 0 |
| 21.12 | 0 |
| 21.13 | 0 |
| 21.14 | 0 |
| 21.15 | 0 |
| 21.16 | 0 |
| 21.17 | 0 |
| 21.18 | 0 |
| 21.19 | 0 |
| 21.2 | 0 |
| 21.21 | 0 |
| 21.22 | 0 |
| 21.23 | 0 |
| 21.24 | 0 |
| 21.25 | 0 |
| 21.26 | 0 |
| 21.27 | 0 |
| 21.28 | 0 |
| 21.29 | 0 |
| 21.3 | 0 |
| 21.31 | 0 |
| 21.32 | 0 |
| 21.33 | 0 |
| 21.34 | 0 |
| 21.35 | 0 |
| 21.36 | 0 |
| 21.37 | 0 |
| 21.38 | 0 |
| 21.39 | 0 |
| 21.4 | 0 |
| 21.41 | 0 |
| 21.42 | 0 |
| 21.43 | 0 |
| 21.44 | 0 |
| 21.45 | 0 |
| 21.46 | 0 |
| 21.47 | 0 |
| 21.48 | 0 |
| 21.49 | 0 |
| 21.5 | 0 |
| 21.51 | 0 |
| 21.52 | 0 |
| 21.53 | 0 |
| 21.54 | 0 |
| 21.55 | 0 |
| 21.56 | 0 |
| 21.57 | 0 |
| 21.58 | 0 |
| 21.59 | 0 |
| 21.6 | 0 |
| 21.61 | 0 |
| 21.62 | 0 |
| 21.63 | 0 |
| 21.64 | 0 |
| 21.65 | 0 |
| 21.66 | 0 |
| 21.67 | 0 |
| 21.68 | 0 |
| 21.69 | 0 |
| 21.7 | 0 |
| 21.71 | 0 |
| 21.72 | 0 |
| 21.73 | 0 |
| 21.74 | 0 |
| 21.75 | 0 |
| 21.76 | 0 |
| 21.77 | 0 |
| 21.78 | 0 |
| 21.79 | 0 |
| 21.8 | 0 |
| 21.81 | 0 |
| 21.82 | 0 |
| 21.83 | 0 |
| 21.84 | 0 |
| 21.85 | 0 |
| 21.86 | 0 |
| 21.87 | 0 |
| 21.88 | 0 |
| 21.89 | 0 |
| 21.9 | 0 |
| 21.91 | 0 |
| 21.92 | 0 |
| 21.93 | 0 |
| 21.94 | 0 |
| 21.95 | 0 |
| 21.96 | 0 |
| 21.97 | 0 |
| 21.98 | 0 |
| 21.99 | 0 |
| 22.0 | 0 |
| 22.01 | 0 |
| 22.02 | 0 |
| 22.03 | 0 |
| 22.04 | 0 |
| 22.05 | 0 |
| 22.06 | 0 |
| 22.07 | 0 |
| 22.08 | 0 |
| 22.09 | 0 |
| 22.1 | 0 |
| 22.11 | 0 |
| 22.12 | 0 |
| 22.13 | 0 |
| 22.14 | 0 |
| 22.15 | 0 |
| 22.16 | 0 |
| 22.17 | 0 |
| 22.18 | 0 |
| 22.19 | 0 |
| 22.2 | 0 |
| 22.21 | 0 |
| 22.22 | 0 |
| 22.23 | 0 |
| 22.24 | 0 |
| 22.25 | 0 |
| 22.26 | 0 |
| 22.27 | 0 |
| 22.28 | 0 |
| 22.29 | 0 |
| 22.3 | 0 |
| 22.31 | 0 |
| 22.32 | 0 |
| 22.33 | 0 |
| 22.34 | 0 |
| 22.35 | 0 |
| 22.36 | 0 |
| 22.37 | 0 |
| 22.38 | 0 |
| 22.39 | 0 |
| 22.4 | 0 |
| 22.41 | 0 |
| 22.42 | 0 |
| 22.43 | 0 |
| 22.44 | 0 |
| 22.45 | 0 |
| 22.46 | 0 |
| 22.47 | 0 |
| 22.48 | 0 |
| 22.49 | 0 |
| 22.5 | 0 |
| 22.51 | 0 |
| 22.52 | 0 |
| 22.53 | 0 |
| 22.54 | 0 |
| 22.55 | 0 |
| 22.56 | 0 |
| 22.57 | 0 |
| 22.58 | 0 |
| 22.59 | 0 |
| 22.6 | 0 |
| 22.61 | 0 |
| 22.62 | 0 |
| 22.63 | 0 |
| 22.64 | 0 |
| 22.65 | 0 |
| 22.66 | 0 |
| 22.67 | 0 |
| 22.68 | 0 |
| 22.69 | 0 |
| 22.7 | 0 |
| 22.71 | 0 |
| 22.72 | 0 |
| 22.73 | 0 |
| 22.74 | 0 |
| 22.75 | 0 |
| 22.76 | 0 |
| 22.77 | 0 |
| 22.78 | 0 |
| 22.79 | 0 |
| 22.8 | 0 |
| 22.81 | 0 |
| 22.82 | 0 |
| 22.83 | 0 |
| 22.84 | 0 |
| 22.85 | 0 |
| 22.86 | 0 |
| 22.87 | 0 |
| 22.88 | 0 |
| 22.89 | 0 |
| 22.9 | 0 |
| 22.91 | 0 |
| 22.92 | 0 |
| 22.93 | 0 |
| 22.94 | 0 |
| 22.95 | 0 |
| 22.96 | 0 |
| 22.97 | 0 |
| 22.98 | 0 |
| 22.99 | 0 |
| 23.0 | 0 |
| 23.01 | 0 |
| 23.02 | 0 |
| 23.03 | 0 |
| 23.04 | 0 |
| 23.05 | 0 |
| 23.06 | 0 |
| 23.07 | 0 |
| 23.08 | 0 |
| 23.09 | 0 |
| 23.1 | 0 |
| 23.11 | 0 |
| 23.12 | 0 |
| 23.13 | 0 |
| 23.14 | 0 |
| 23.15 | 0 |
| 23.16 | 0 |
| 23.17 | 0 |
| 23.18 | 0 |
| 23.19 | 0 |
| 23.2 | 0 |
| 23.21 | 0 |
| 23.22 | 0 |
| 23.23 | 0 |
| 23.24 | 0 |
| 23.25 | 0 |
| 23.26 | 0 |
| 23.27 | 0 |
| 23.28 | 0 |
| 23.29 | 0 |
| 23.3 | 0 |
| 23.31 | 0 |
| 23.32 | 0 |
| 23.33 | 0 |
| 23.34 | 0 |
| 23.35 | 0 |
| 23.36 | 0 |
| 23.37 | 0 |
| 23.38 | 0 |
| 23.39 | 0 |
| 23.4 | 0 |
| 23.41 | 0 |
| 23.42 | 0 |
| 23.43 | 0 |
| 23.44 | 0 |
| 23.45 | 0 |
| 23.46 | 0 |
| 23.47 | 0 |
| 23.48 | 0 |
| 23.49 | 0 |
| 23.5 | 0 |
| 23.51 | 0 |
| 23.52 | 0 |
| 23.53 | 0 |
| 23.54 | 0 |
| 23.55 | 0 |
| 23.56 | 0 |
| 23.57 | 0 |
| 23.58 | 0 |
| 23.59 | 0 |
| 23.6 | 0 |
| 23.61 | 0 |
| 23.62 | 0 |
| 23.63 | 0 |
| 23.64 | 0 |
| 23.65 | 0 |
| 23.66 | 0 |
| 23.67 | 0 |
| 23.68 | 0 |
| 23.69 | 0 |
| 23.7 | 0 |
| 23.71 | 0 |
| 23.72 | 0 |
| 23.73 | 0 |
| 23.74 | 0 |
| 23.75 | 0 |
| 23.76 | 0 |
| 23.77 | 0 |
| 23.78 | 0 |
| 23.79 | 0 |
| 23.8 | 0 |
| 23.81 | 0 |
| 23.82 | 0 |
| 23.83 | 0 |
| 23.84 | 0 |
| 23.85 | 0 |
| 23.86 | 0 |
| 23.87 | 0 |
| 23.88 | 0 |
| 23.89 | 0 |
| 23.9 | 0 |
| 23.91 | 0 |
| 23.92 | 0 |
| 23.93 | 0 |
| 23.94 | 0 |
| 23.95 | 0 |
| 23.96 | 0 |
| 23.97 | 0 |
| 23.98 | 0 |
| 23.99 | 0 |
| 24.0 | 0 |
| 24.01 | 0 |
| 24.02 | 0 |
| 24.03 | 0 |
| 24.04 | 0 |
| 24.05 | 0 |
| 24.06 | 0 |
| 24.07 | 0 |
| 24.08 | 0 |
| 24.09 | 0 |
| 24.1 | 0 |
| 24.11 | 0 |
| 24.12 | 0 |
| 24.13 | 0 |
| 24.14 | 0 |
| 24.15 | 0 |
| 24.16 | 0 |
| 24.17 | 0 |
| 24.18 | 0 |
| 24.19 | 0 |
| 24.2 | 0 |
| 24.21 | 0 |
| 24.22 | 0 |
| 24.23 | 0 |
| 24.24 | 0 |
| 24.25 | 0 |
| 24.26 | 0 |
| 24.27 | 0 |
| 24.28 | 0 |
| 24.29 | 0 |
| 24.3 | 0 |
| 24.31 | 0 |
| 24.32 | 0 |
| 24.33 | 0 |
| 24.34 | 0 |
| 24.35 | 0 |
| 24.36 | 0 |
| 24.37 | 0 |
| 24.38 | 0 |
| 24.39 | 0 |
| 24.4 | 0 |
| 24.41 | 0 |
| 24.42 | 0 |
| 24.43 | 0 |
| 24.44 | 0 |
| 24.45 | 0 |
| 24.46 | 0 |
| 24.47 | 0 |
| 24.48 | 0 |
| 24.49 | 0 |
| 24.5 | 0 |
| 24.51 | 0 |
| 24.52 | 0 |
| 24.53 | 0 |
| 24.54 | 0 |
| 24.55 | 0 |
| 24.56 | 0 |
| 24.57 | 0 |
| 24.58 | 0 |
| 24.59 | 0 |
| 24.6 | 0 |
| 24.61 | 0 |
| 24.62 | 0 |
| 24.63 | 0 |
| 24.64 | 0 |
| 24.65 | 0 |
| 24.66 | 0 |
| 24.67 | 0 |
| 24.68 | 0 |
| 24.69 | 0 |
| 24.7 | 0 |
| 24.71 | 0 |
| 24.72 | 0 |
| 24.73 | 0 |
| 24.74 | 0 |
| 24.75 | 0 |
| 24.76 | 0 |
| 24.77 | 0 |
| 24.78 | 0 |
| 24.79 | 0 |
| 24.8 | 0 |
| 24.81 | 0 |
| 24.82 | 0 |
| 24.83 | 0 |
| 24.84 | 0 |
| 24.85 | 0 |
| 24.86 | 0 |
| 24.87 | 0 |
| 24.88 | 0 |
| 24.89 | 0 |
| 24.9 | 0 |
| 24.91 | 0 |
| 24.92 | 0 |
| 24.93 | 0 |
| 24.94 | 0 |
| 24.95 | 0 |
| 24.96 | 0 |
| 24.97 | 0 |
| 24.98 | 0 |
| 24.99 | 0 |
| 25.0 | 0 |
| 25.01 | 0 |
| 25.02 | 0 |
| 25.03 | 0 |
| 25.04 | 0 |
| 25.05 | 0 |
| 25.06 | 0 |
| 25.07 | 0 |
| 25.08 | 0 |
| 25.09 | 0 |
| 25.1 | 0 |
| 25.11 | 0 |
| 25.12 | 0 |
| 25.13 | 0 |
| 25.14 | 0 |
| 25.15 | 0 |
| 25.16 | 0 |
| 25.17 | 0 |
| 25.18 | 0 |
| 25.19 | 0 |
| 25.2 | 0 |
| 25.21 | 0 |
| 25.22 | 0 |
| 25.23 | 0 |
| 25.24 | 0 |
| 25.25 | 0 |
| 25.26 | 0 |
| 25.27 | 0 |
| 25.28 | 0 |
| 25.29 | 0 |
| 25.3 | 0 |
| 25.31 | 0 |
| 25.32 | 0 |
| 25.33 | 0 |
| 25.34 | 0 |
| 25.35 | 0 |
| 25.36 | 0 |
| 25.37 | 0 |
| 25.38 | 0 |
| 25.39 | 0 |
| 25.4 | 0 |
| 25.41 | 0 |
| 25.42 | 0 |
| 25.43 | 0 |
| 25.44 | 0 |
| 25.45 | 0 |
| 25.46 | 0 |
| 25.47 | 0 |
| 25.48 | 0 |
| 25.49 | 0 |
| 25.5 | 0 |
| 25.51 | 0 |
| 25.52 | 0 |
| 25.53 | 0 |
| 25.54 | 0 |
| 25.55 | 0 |
| 25.56 | 0 |
| 25.57 | 0 |
| 25.58 | 0 |
| 25.59 | 0 |
| 25.6 | 0 |
| 25.61 | 0 |
| 25.62 | 0 |
| 25.63 | 0 |
| 25.64 | 0 |
| 25.65 | 0 |
| 25.66 | 0 |
| 25.67 | 0 |
| 25.68 | 0 |
| 25.69 | 0 |
| 25.7 | 0 |
| 25.71 | 0 |
| 25.72 | 0 |
| 25.73 | 0 |
| 25.74 | 0 |
| 25.75 | 0 |
| 25.76 | 0 |
| 25.77 | 0 |
| 25.78 | 0 |
| 25.79 | 0 |
| 25.8 | 0 |
| 25.81 | 0 |
| 25.82 | 0 |
| 25.83 | 0 |
| 25.84 | 0 |
| 25.85 | 0 |
| 25.86 | 0 |
| 25.87 | 0 |
| 25.88 | 0 |
| 25.89 | 0 |
| 25.9 | 0 |
| 25.91 | 0 |
| 25.92 | 0 |
| 25.93 | 0 |
| 25.94 | 0 |
| 25.95 | 0 |
| 25.96 | 0 |
| 25.97 | 0 |
| 25.98 | 0 |
| 25.99 | 0 |
| 26.0 | 0 |
| 26.01 | 0 |
| 26.02 | 0 |
| 26.03 | 0 |
| 26.04 | 0 |
| 26.05 | 0 |
| 26.06 | 0 |
| 26.07 | 0 |
| 26.08 | 0 |
| 26.09 | 0 |
| 26.1 | 0 |
| 26.11 | 0 |
| 26.12 | 0 |
| 26.13 | 0 |
| 26.14 | 0 |
| 26.15 | 0 |
| 26.16 | 0 |
| 26.17 | 0 |
| 26.18 | 0 |
| 26.19 | 0 |
| 26.2 | 0 |
| 26.21 | 0 |
| 26.22 | 0 |
| 26.23 | 0 |
| 26.24 | 0 |
| 26.25 | 0 |
| 26.26 | 0 |
| 26.27 | 0 |
| 26.28 | 0 |
| 26.29 | 0 |
| 26.3 | 0 |
| 26.31 | 0 |
| 26.32 | 0 |
| 26.33 | 0 |
| 26.34 | 0 |
| 26.35 | 0 |
| 26.36 | 0 |
| 26.37 | 0 |
| 26.38 | 0 |
| 26.39 | 0 |
| 26.4 | 0 |
| 26.41 | 0 |
| 26.42 | 0 |
| 26.43 | 0 |
| 26.44 | 0 |
| 26.45 | 0 |
| 26.46 | 0 |
| 26.47 | 0 |
| 26.48 | 0 |
| 26.49 | 0 |
| 26.5 | 0 |
| 26.51 | 0 |
| 26.52 | 0 |
| 26.53 | 0 |
| 26.54 | 0 |
| 26.55 | 0 |
| 26.56 | 0 |
| 26.57 | 0 |
| 26.58 | 0 |
| 26.59 | 0 |
| 26.6 | 0 |
| 26.61 | 0 |
| 26.62 | 0 |
| 26.63 | 0 |
| 26.64 | 0 |
| 26.65 | 0 |
| 26.66 | 0 |
| 26.67 | 0 |
| 26.68 | 0 |
| 26.69 | 0 |
| 26.7 | 0 |
| 26.71 | 0 |
| 26.72 | 0 |
| 26.73 | 0 |
| 26.74 | 0 |
| 26.75 | 0 |
| 26.76 | 0 |
| 26.77 | 0 |
| 26.78 | 0 |
| 26.79 | 0 |
| 26.8 | 0 |
| 26.81 | 0 |
| 26.82 | 0 |
| 26.83 | 0 |
| 26.84 | 0 |
| 26.85 | 0 |
| 26.86 | 0 |
| 26.87 | 0 |
| 26.88 | 0 |
| 26.89 | 0 |
| 26.9 | 0 |
| 26.91 | 0 |
| 26.92 | 0 |
| 26.93 | 0 |
| 26.94 | 0 |
| 26.95 | 0 |
| 26.96 | 0 |
| 26.97 | 0 |
| 26.98 | 0 |
| 26.99 | 0 |
| 27.0 | 0 |
| 27.01 | 0 |
| 27.02 | 0 |
| 27.03 | 0 |
| 27.04 | 0 |
| 27.05 | 0 |
| 27.06 | 0 |
| 27.07 | 0 |
| 27.08 | 0 |
| 27.09 | 0 |
| 27.1 | 0 |
| 27.11 | 0 |
| 27.12 | 0 |
| 27.13 | 0 |
| 27.14 | 0 |
| 27.15 | 0 |
| 27.16 | 0 |
| 27.17 | 0 |
| 27.18 | 0 |
| 27.19 | 0 |
| 27.2 | 0 |
| 27.21 | 0 |
| 27.22 | 0 |
| 27.23 | 0 |
| 27.24 | 0 |
| 27.25 | 0 |
| 27.26 | 0 |
| 27.27 | 0 |
| 27.28 | 0 |
| 27.29 | 0 |
| 27.3 | 0 |
| 27.31 | 0 |
| 27.32 | 0 |
| 27.33 | 0 |
| 27.34 | 0 |
| 27.35 | 0 |
| 27.36 | 0 |
| 27.37 | 0 |
| 27.38 | 0 |
| 27.39 | 0 |
| 27.4 | 0 |
| 27.41 | 0 |
| 27.42 | 0 |
| 27.43 | 0 |
| 27.44 | 0 |
| 27.45 | 0 |
| 27.46 | 0 |
| 27.47 | 0 |
| 27.48 | 0 |
| 27.49 | 0 |
| 27.5 | 0 |
| 27.51 | 0 |
| 27.52 | 0 |
| 27.53 | 0 |
| 27.54 | 0 |
| 27.55 | 0 |
| 27.56 | 0 |
| 27.57 | 0 |
| 27.58 | 0 |
| 27.59 | 0 |
| 27.6 | 0 |
| 27.61 | 0 |
| 27.62 | 0 |
| 27.63 | 0 |
| 27.64 | 0 |
| 27.65 | 0 |
| 27.66 | 0 |
| 27.67 | 0 |
| 27.68 | 0 |
| 27.69 | 0 |
| 27.7 | 0 |
| 27.71 | 0 |
| 27.72 | 0 |
| 27.73 | 0 |
| 27.74 | 0 |
| 27.75 | 0 |
| 27.76 | 0 |
| 27.77 | 0 |
| 27.78 | 0 |
| 27.79 | 0 |
| 27.8 | 0 |
| 27.81 | 0 |
| 27.82 | 0 |
| 27.83 | 0 |
| 27.84 | 0 |
| 27.85 | 0 |
| 27.86 | 0 |
| 27.87 | 0 |
| 27.88 | 0 |
| 27.89 | 0 |
| 27.9 | 0 |
| 27.91 | 0 |
| 27.92 | 0 |
| 27.93 | 0 |
| 27.94 | 0 |
| 27.95 | 0 |
| 27.96 | 0 |
| 27.97 | 0 |
| 27.98 | 0 |
| 27.99 | 0 |
| 28.0 | 0 |
| 28.01 | 0 |
| 28.02 | 0 |
| 28.03 | 0 |
| 28.04 | 0 |
| 28.05 | 0 |
| 28.06 | 0 |
| 28.07 | 0 |
| 28.08 | 0 |
| 28.09 | 0 |
| 28.1 | 0 |
| 28.11 | 0 |
| 28.12 | 0 |
| 28.13 | 0 |
| 28.14 | 0 |
| 28.15 | 0 |
| 28.16 | 0 |
| 28.17 | 0 |
| 28.18 | 0 |
| 28.19 | 0 |
| 28.2 | 0 |
| 28.21 | 0 |
| 28.22 | 0 |
| 28.23 | 0 |
| 28.24 | 0 |
| 28.25 | 0 |
| 28.26 | 0 |
| 28.27 | 0 |
| 28.28 | 0 |
| 28.29 | 0 |
| 28.3 | 0 |
| 28.31 | 0 |
| 28.32 | 0 |
| 28.33 | 0 |
| 28.34 | 0 |
| 28.35 | 0 |
| 28.36 | 0 |
| 28.37 | 0 |
| 28.38 | 0 |
| 28.39 | 0 |
| 28.4 | 0 |
| 28.41 | 0 |
| 28.42 | 0 |
| 28.43 | 0 |
| 28.44 | 0 |
| 28.45 | 0 |
| 28.46 | 0 |
| 28.47 | 0 |
| 28.48 | 0 |
| 28.49 | 0 |
| 28.5 | 0 |
| 28.51 | 0 |
| 28.52 | 0 |
| 28.53 | 0 |
| 28.54 | 0 |
| 28.55 | 0 |
| 28.56 | 0 |
| 28.57 | 0 |
| 28.58 | 0 |
| 28.59 | 0 |
| 28.6 | 0 |
| 28.61 | 0 |
| 28.62 | 0 |
| 28.63 | 0 |
| 28.64 | 0 |
| 28.65 | 0 |
| 28.66 | 0 |
| 28.67 | 0 |
| 28.68 | 0 |
| 28.69 | 0 |
| 28.7 | 0 |
| 28.71 | 0 |
| 28.72 | 0 |
| 28.73 | 0 |
| 28.74 | 0 |
| 28.75 | 0 |
| 28.76 | 0 |
| 28.77 | 0 |
| 28.78 | 0 |
| 28.79 | 0 |
| 28.8 | 0 |
| 28.81 | 0 |
| 28.82 | 0 |
| 28.83 | 0 |
| 28.84 | 0 |
| 28.85 | 0 |
| 28.86 | 0 |
| 28.87 | 0 |
| 28.88 | 0 |
| 28.89 | 0 |
| 28.9 | 0 |
| 28.91 | 0 |
| 28.92 | 0 |
| 28.93 | 0 |
| 28.94 | 0 |
| 28.95 | 0 |
| 28.96 | 0 |
| 28.97 | 0 |
| 28.98 | 0 |
| 28.99 | 0 |
| 29.0 | 0 |
| 29.01 | 0 |
| 29.02 | 0 |
| 29.03 | 0 |
| 29.04 | 0 |
| 29.05 | 0 |
| 29.06 | 0 |
| 29.07 | 0 |
| 29.08 | 0 |
| 29.09 | 0 |
| 29.1 | 0 |
| 29.11 | 0 |
| 29.12 | 0 |
| 29.13 | 0 |
| 29.14 | 0 |
| 29.15 | 0 |
| 29.16 | 0 |
| 29.17 | 0 |
| 29.18 | 0 |
| 29.19 | 0 |
| 29.2 | 0 |
| 29.21 | 0 |
| 29.22 | 0 |
| 29.23 | 0 |
| 29.24 | 0 |
| 29.25 | 0 |
| 29.26 | 0 |
| 29.27 | 0 |
| 29.28 | 0 |
| 29.29 | 0 |
| 29.3 | 0 |
| 29.31 | 0 |
| 29.32 | 0 |
| 29.33 | 0 |
| 29.34 | 0 |
| 29.35 | 0 |
| 29.36 | 0 |
| 29.37 | 0 |
| 29.38 | 0 |
| 29.39 | 0 |
| 29.4 | 0 |
| 29.41 | 0 |
| 29.42 | 0 |
| 29.43 | 0 |
| 29.44 | 0 |
| 29.45 | 0 |
| 29.46 | 0 |
| 29.47 | 0 |
| 29.48 | 0 |
| 29.49 | 0 |
| 29.5 | 0 |
| 29.51 | 0 |
| 29.52 | 0 |
| 29.53 | 0 |
| 29.54 | 0 |
| 29.55 | 0 |
| 29.56 | 0 |
| 29.57 | 0 |
| 29.58 | 0 |
| 29.59 | 0 |
| 29.6 | 0 |
| 29.61 | 0 |
| 29.62 | 0 |
| 29.63 | 0 |
| 29.64 | 0 |
| 29.65 | 0 |
| 29.66 | 0 |
| 29.67 | 0 |
| 29.68 | 0 |
| 29.69 | 0 |
| 29.7 | 0 |
| 29.71 | 0 |
| 29.72 | 0 |
| 29.73 | 0 |
| 29.74 | 0 |
| 29.75 | 0 |
| 29.76 | 0 |
| 29.77 | 0 |
| 29.78 | 0 |
| 29.79 | 0 |
| 29.8 | 0 |
| 29.81 | 0 |
| 29.82 | 0 |
| 29.83 | 0 |
| 29.84 | 0 |
| 29.85 | 0 |
| 29.86 | 0 |
| 29.87 | 0 |
| 29.88 | 0 |
| 29.89 | 0 |
| 29.9 | 0 |
| 29.91 | 0 |
| 29.92 | 0 |
| 29.93 | 0 |
| 29.94 | 0 |
| 29.95 | 0 |
| 29.96 | 0 |
| 29.97 | 0 |
| 29.98 | 0 |
| 29.99 | 0 |
| 30.0 | 0 |
| 30.01 | 0 |
| 30.02 | 0 |
| 30.03 | 0 |
| 30.04 | 0 |
| 30.05 | 0 |
| 30.06 | 0 |
| 30.07 | 0 |
| 30.08 | 0 |
| 30.09 | 0 |
| 30.1 | 0 |
| 30.11 | 0 |
| 30.12 | 0 |
| 30.13 | 0 |
| 30.14 | 0 |
| 30.15 | 0 |
| 30.16 | 0 |
| 30.17 | 0 |
| 30.18 | 0 |
| 30.19 | 0 |
| 30.2 | 0 |
| 30.21 | 0 |
| 30.22 | 0 |
| 30.23 | 0 |
| 30.24 | 0 |
| 30.25 | 0 |
| 30.26 | 0 |
| 30.27 | 0 |
| 30.28 | 0 |
| 30.29 | 0 |
| 30.3 | 0 |
| 30.31 | 0 |
| 30.32 | 0 |
| 30.33 | 0 |
| 30.34 | 0 |
| 30.35 | 0 |
| 30.36 | 0 |
| 30.37 | 0 |
| 30.38 | 0 |
| 30.39 | 0 |
| 30.4 | 0 |
| 30.41 | 0 |
| 30.42 | 0 |
| 30.43 | 0 |
| 30.44 | 0 |
| 30.45 | 0 |
| 30.46 | 0 |
| 30.47 | 0 |
| 30.48 | 0 |
| 30.49 | 0 |
| 30.5 | 0 |
| 30.51 | 0 |
| 30.52 | 0 |
| 30.53 | 0 |
| 30.54 | 0 |
| 30.55 | 0 |
| 30.56 | 0 |
| 30.57 | 0 |
| 30.58 | 0 |
| 30.59 | 0 |
| 30.6 | 0 |
| 30.61 | 0 |
| 30.62 | 0 |
| 30.63 | 0 |
| 30.64 | 0 |
| 30.65 | 0 |
| 30.66 | 0 |
| 30.67 | 0 |
| 30.68 | 0 |
| 30.69 | 0 |
| 30.7 | 0 |
| 30.71 | 0 |
| 30.72 | 0 |
| 30.73 | 0 |
| 30.74 | 0 |
| 30.75 | 0 |
| 30.76 | 0 |
| 30.77 | 0 |
| 30.78 | 0 |
| 30.79 | 0 |
| 30.8 | 0 |
| 30.81 | 0 |
| 30.82 | 0 |
| 30.83 | 0 |
| 30.84 | 0 |
| 30.85 | 0 |
| 30.86 | 0 |
| 30.87 | 0 |
| 30.88 | 0 |
| 30.89 | 0 |
| 30.9 | 0 |
| 30.91 | 0 |
| 30.92 | 0 |
| 30.93 | 0 |
| 30.94 | 0 |
| 30.95 | 0 |
| 30.96 | 0 |
| 30.97 | 0 |
| 30.98 | 0 |
| 30.99 | 0 |
| 31.0 | 0 |
| 31.01 | 0 |
| 31.02 | 0 |
| 31.03 | 0 |
| 31.04 | 0 |
| 31.05 | 0 |
| 31.06 | 0 |
| 31.07 | 0 |
| 31.08 | 0 |
| 31.09 | 0 |
| 31.1 | 0 |
| 31.11 | 0 |
| 31.12 | 0 |
| 31.13 | 0 |
| 31.14 | 0 |
| 31.15 | 0 |
| 31.16 | 0 |
| 31.17 | 0 |
| 31.18 | 0 |
| 31.19 | 0 |
| 31.2 | 0 |
| 31.21 | 0 |
| 31.22 | 0 |
| 31.23 | 0 |
| 31.24 | 0 |
| 31.25 | 0 |
| 31.26 | 0 |
| 31.27 | 0 |
| 31.28 | 0 |
| 31.29 | 0 |
| 31.3 | 0 |
| 31.31 | 0 |
| 31.32 | 0 |
| 31.33 | 0 |
| 31.34 | 0 |
| 31.35 | 0 |
| 31.36 | 0 |
| 31.37 | 0 |
| 31.38 | 0 |
| 31.39 | 0 |
| 31.4 | 0 |
| 31.41 | 0 |
| 31.42 | 0 |
| 31.43 | 0 |
| 31.44 | 0 |
| 31.45 | 0 |
| 31.46 | 0 |
| 31.47 | 0 |
| 31.48 | 0 |
| 31.49 | 0 |
| 31.5 | 0 |
| 31.51 | 0 |
| 31.52 | 0 |
| 31.53 | 0 |
| 31.54 | 0 |
| 31.55 | 0 |
| 31.56 | 0 |
| 31.57 | 0 |
| 31.58 | 0 |
| 31.59 | 0 |
| 31.6 | 0 |
| 31.61 | 0 |
| 31.62 | 0 |
| 31.63 | 0 |
| 31.64 | 0 |
| 31.65 | 0 |
| 31.66 | 0 |
| 31.67 | 0 |
| 31.68 | 0 |
| 31.69 | 0 |
| 31.7 | 0 |
| 31.71 | 0 |
| 31.72 | 0 |
| 31.73 | 0 |
| 31.74 | 0 |
| 31.75 | 0 |
| 31.76 | 0 |
| 31.77 | 0 |
| 31.78 | 0 |
| 31.79 | 0 |
| 31.8 | 0 |
| 31.81 | 0 |
| 31.82 | 0 |
| 31.83 | 0 |
| 31.84 | 0 |
| 31.85 | 0 |
| 31.86 | 0 |
| 31.87 | 0 |
| 31.88 | 0 |
| 31.89 | 0 |
| 31.9 | 0 |
| 31.91 | 0 |
| 31.92 | 0 |
| 31.93 | 0 |
| 31.94 | 0 |
| 31.95 | 0 |
| 31.96 | 0 |
| 31.97 | 0 |
| 31.98 | 0 |
| 31.99 | 0 |
| 32.0 | 0 |
| 32.01 | 0 |
| 32.02 | 0 |
| 32.03 | 0 |
| 32.04 | 0 |
| 32.05 | 0 |
| 32.06 | 0 |
| 32.07 | 0 |
| 32.08 | 0 |
| 32.09 | 0 |
| 32.1 | 0 |
| 32.11 | 0 |
| 32.12 | 0 |
| 32.13 | 0 |
| 32.14 | 0 |
| 32.15 | 0 |
| 32.16 | 0 |
| 32.17 | 0 |
| 32.18 | 0 |
| 32.19 | 0 |
| 32.2 | 0 |
| 32.21 | 0 |
| 32.22 | 0 |
| 32.23 | 0 |
| 32.24 | 0 |
| 32.25 | 0 |
| 32.26 | 0 |
| 32.27 | 0 |
| 32.28 | 0 |
| 32.29 | 0 |
| 32.3 | 0 |
| 32.31 | 0 |
| 32.32 | 0 |
| 32.33 | 0 |
| 32.34 | 0 |
| 32.35 | 0 |
| 32.36 | 0 |
| 32.37 | 0 |
| 32.38 | 0 |
| 32.39 | 0 |
| 32.4 | 0 |
| 32.41 | 0 |
| 32.42 | 0 |
| 32.43 | 0 |
| 32.44 | 0 |
| 32.45 | 0 |
| 32.46 | 0 |
| 32.47 | 0 |
| 32.48 | 0 |
| 32.49 | 0 |
| 32.5 | 0 |
| 32.51 | 0 |
| 32.52 | 0 |
| 32.53 | 0 |
| 32.54 | 0 |
| 32.55 | 0 |
| 32.56 | 0 |
| 32.57 | 0 |
| 32.58 | 0 |
| 32.59 | 0 |
| 32.6 | 0 |
| 32.61 | 0 |
| 32.62 | 0 |
| 32.63 | 0 |
| 32.64 | 0 |
| 32.65 | 0 |
| 32.66 | 0 |
| 32.67 | 0 |
| 32.68 | 0 |
| 32.69 | 0 |
| 32.7 | 0 |
| 32.71 | 0 |
| 32.72 | 0 |
| 32.73 | 0 |
| 32.74 | 0 |
| 32.75 | 0 |
| 32.76 | 0 |
| 32.77 | 0 |
| 32.78 | 0 |
| 32.79 | 0 |
| 32.8 | 0 |
| 32.81 | 0 |
| 32.82 | 0 |
| 32.83 | 0 |
| 32.84 | 0 |
| 32.85 | 0 |
| 32.86 | 0 |
| 32.87 | 0 |
| 32.88 | 0 |
| 32.89 | 0 |
| 32.9 | 0 |
| 32.91 | 0 |
| 32.92 | 0 |
| 32.93 | 0 |
| 32.94 | 0 |
| 32.95 | 0 |
| 32.96 | 0 |
| 32.97 | 0 |
| 32.98 | 0 |
| 32.99 | 0 |
| 33.0 | 0 |
| 33.01 | 0 |
| 33.02 | 0 |
| 33.03 | 0 |
| 33.04 | 0 |
| 33.05 | 0 |
| 33.06 | 0 |
| 33.07 | 0 |
| 33.08 | 0 |
| 33.09 | 0 |
| 33.1 | 0 |
| 33.11 | 0 |
| 33.12 | 0 |
| 33.13 | 0 |
| 33.14 | 0 |
| 33.15 | 0 |
| 33.16 | 0 |
| 33.17 | 0 |
| 33.18 | 0 |
| 33.19 | 0 |
| 33.2 | 0 |
| 33.21 | 0 |
| 33.22 | 0 |
| 33.23 | 0 |
| 33.24 | 0 |
| 33.25 | 0 |
| 33.26 | 0 |
| 33.27 | 0 |
| 33.28 | 0 |
| 33.29 | 0 |
| 33.3 | 0 |
| 33.31 | 0 |
| 33.32 | 0 |
| 33.33 | 0 |
| 33.34 | 0 |
| 33.35 | 0 |
| 33.36 | 0 |
| 33.37 | 0 |
| 33.38 | 0 |
| 33.39 | 0 |
| 33.4 | 0 |
| 33.41 | 0 |
| 33.42 | 0 |
| 33.43 | 0 |
| 33.44 | 0 |
| 33.45 | 0 |
| 33.46 | 0 |
| 33.47 | 0 |
| 33.48 | 0 |
| 33.49 | 0 |
| 33.5 | 0 |
| 33.51 | 0 |
| 33.52 | 0 |
| 33.53 | 0 |
| 33.54 | 0 |
| 33.55 | 0 |
| 33.56 | 0 |
| 33.57 | 0 |
| 33.58 | 0 |
| 33.59 | 0 |
| 33.6 | 0 |
| 33.61 | 0 |
| 33.62 | 0 |
| 33.63 | 0 |
| 33.64 | 0 |
| 33.65 | 0 |
| 33.66 | 0 |
| 33.67 | 0 |
| 33.68 | 0 |
| 33.69 | 0 |
| 33.7 | 0 |
| 33.71 | 0 |
| 33.72 | 0 |
| 33.73 | 0 |
| 33.74 | 0 |
| 33.75 | 0 |
| 33.76 | 0 |
| 33.77 | 0 |
| 33.78 | 0 |
| 33.79 | 0 |
| 33.8 | 0 |
| 33.81 | 0 |
| 33.82 | 0 |
| 33.83 | 0 |
| 33.84 | 0 |
| 33.85 | 0 |
| 33.86 | 0 |
| 33.87 | 0 |
| 33.88 | 0 |
| 33.89 | 0 |
| 33.9 | 0 |
| 33.91 | 0 |
| 33.92 | 0 |
| 33.93 | 0 |
| 33.94 | 0 |
| 33.95 | 0 |
| 33.96 | 0 |
| 33.97 | 0 |
| 33.98 | 0 |
| 33.99 | 0 |
| 34.0 | 0 |
| 34.01 | 0 |
| 34.02 | 0 |
| 34.03 | 0 |
| 34.04 | 0 |
| 34.05 | 0 |
| 34.06 | 0 |
| 34.07 | 0 |
| 34.08 | 0 |
| 34.09 | 0 |
| 34.1 | 0 |
| 34.11 | 0 |
| 34.12 | 0 |
| 34.13 | 0 |
| 34.14 | 0 |
| 34.15 | 0 |
| 34.16 | 0 |
| 34.17 | 0 |
| 34.18 | 0 |
| 34.19 | 0 |
| 34.2 | 0 |
| 34.21 | 0 |
| 34.22 | 0 |
| 34.23 | 0 |
| 34.24 | 0 |
| 34.25 | 0 |
| 34.26 | 0 |
| 34.27 | 0 |
| 34.28 | 0 |
| 34.29 | 0 |
| 34.3 | 0 |
| 34.31 | 0 |
| 34.32 | 0 |
| 34.33 | 0 |
| 34.34 | 0 |
| 34.35 | 0 |
| 34.36 | 0 |
| 34.37 | 0 |
| 34.38 | 0 |
| 34.39 | 0 |
| 34.4 | 0 |
| 34.41 | 0 |
| 34.42 | 0 |
| 34.43 | 0 |
| 34.44 | 0 |
| 34.45 | 0 |
| 34.46 | 0 |
| 34.47 | 0 |
| 34.48 | 0 |
| 34.49 | 0 |
| 34.5 | 0 |
| 34.51 | 0 |
| 34.52 | 0 |
| 34.53 | 0 |
| 34.54 | 0 |
| 34.55 | 0 |
| 34.56 | 0 |
| 34.57 | 0 |
| 34.58 | 0 |
| 34.59 | 0 |
| 34.6 | 0 |
| 34.61 | 0 |
| 34.62 | 0 |
| 34.63 | 0 |
| 34.64 | 0 |
| 34.65 | 0 |
| 34.66 | 0 |
| 34.67 | 0 |
| 34.68 | 0 |
| 34.69 | 0 |
| 34.7 | 0 |
| 34.71 | 0 |
| 34.72 | 0 |
| 34.73 | 0 |
| 34.74 | 0 |
| 34.75 | 0 |
| 34.76 | 0 |
| 34.77 | 0 |
| 34.78 | 0 |
| 34.79 | 0 |
| 34.8 | 0 |
| 34.81 | 0 |
| 34.82 | 0 |
| 34.83 | 0 |
| 34.84 | 0 |
| 34.85 | 0 |
| 34.86 | 0 |
| 34.87 | 0 |
| 34.88 | 0 |
| 34.89 | 0 |
| 34.9 | 0 |
| 34.91 | 0 |
| 34.92 | 0 |
| 34.93 | 0 |
| 34.94 | 0 |
| 34.95 | 0 |
| 34.96 | 0 |
| 34.97 | 0 |
| 34.98 | 0 |
| 34.99 | 0 |
| 35.0 | 0 |
| 35.01 | 0 |
| 35.02 | 0 |
| 35.03 | 0 |
| 35.04 | 0 |
| 35.05 | 0 |
| 35.06 | 0 |
| 35.07 | 0 |
| 35.08 | 0 |
| 35.09 | 0 |
| 35.1 | 0 |
| 35.11 | 0 |
| 35.12 | 0 |
| 35.13 | 0 |
| 35.14 | 0 |
| 35.15 | 0 |
| 35.16 | 0 |
| 35.17 | 0 |
| 35.18 | 0 |
| 35.19 | 0 |
| 35.2 | 0 |
| 35.21 | 0 |
| 35.22 | 0 |
| 35.23 | 0 |
| 35.24 | 0 |
| 35.25 | 0 |
| 35.26 | 0 |
| 35.27 | 0 |
| 35.28 | 0 |
| 35.29 | 0 |
| 35.3 | 0 |
| 35.31 | 0 |
| 35.32 | 0 |
| 35.33 | 0 |
| 35.34 | 0 |
| 35.35 | 0 |
| 35.36 | 0 |
| 35.37 | 0 |
| 35.38 | 0 |
| 35.39 | 0 |
| 35.4 | 0 |
| 35.41 | 0 |
| 35.42 | 0 |
| 35.43 | 0 |
| 35.44 | 0 |
| 35.45 | 0 |
| 35.46 | 0 |
| 35.47 | 0 |
| 35.48 | 0 |
| 35.49 | 0 |
| 35.5 | 0 |
| 35.51 | 0 |
| 35.52 | 0 |
| 35.53 | 0 |
| 35.54 | 0 |
| 35.55 | 0 |
| 35.56 | 0 |
| 35.57 | 0 |
| 35.58 | 0 |
| 35.59 | 0 |
| 35.6 | 0 |
| 35.61 | 0 |
| 35.62 | 0 |
| 35.63 | 0 |
| 35.64 | 0 |
| 35.65 | 0 |
| 35.66 | 0 |
| 35.67 | 0 |
| 35.68 | 0 |
| 35.69 | 0 |
| 35.7 | 0 |
| 35.71 | 0 |
| 35.72 | 0 |
| 35.73 | 0 |
| 35.74 | 0 |
| 35.75 | 0 |
| 35.76 | 0 |
| 35.77 | 0 |
| 35.78 | 0 |
| 35.79 | 0 |
| 35.8 | 0 |
| 35.81 | 0 |
| 35.82 | 0 |
| 35.83 | 0 |
| 35.84 | 0 |
| 35.85 | 0 |
| 35.86 | 0 |
| 35.87 | 0 |
| 35.88 | 0 |
| 35.89 | 0 |
| 35.9 | 0 |
| 35.91 | 0 |
| 35.92 | 0 |
| 35.93 | 0 |
| 35.94 | 0 |
| 35.95 | 0 |
| 35.96 | 0 |
| 35.97 | 0 |
| 35.98 | 0 |
| 35.99 | 0 |
| 36.0 | 0 |
| 36.01 | 0 |
| 36.02 | 0 |
| 36.03 | 0 |
| 36.04 | 0 |
| 36.05 | 0 |
| 36.06 | 0 |
| 36.07 | 0 |
| 36.08 | 0 |
| 36.09 | 0 |
| 36.1 | 0 |
| 36.11 | 0 |
| 36.12 | 0 |
| 36.13 | 0 |
| 36.14 | 0 |
| 36.15 | 0 |
| 36.16 | 0 |
| 36.17 | 0 |
| 36.18 | 0 |
| 36.19 | 0 |
| 36.2 | 0 |
| 36.21 | 0 |
| 36.22 | 0 |
| 36.23 | 0 |
| 36.24 | 0 |
| 36.25 | 0 |
| 36.26 | 0 |
| 36.27 | 0 |
| 36.28 | 0 |
| 36.29 | 0 |
| 36.3 | 0 |
| 36.31 | 0 |
| 36.32 | 0 |
| 36.33 | 0 |
| 36.34 | 0 |
| 36.35 | 0 |
| 36.36 | 0 |
| 36.37 | 0 |
| 36.38 | 0 |
| 36.39 | 0 |
| 36.4 | 0 |
| 36.41 | 0 |
| 36.42 | 0 |
| 36.43 | 0 |
| 36.44 | 0 |
| 36.45 | 0 |
| 36.46 | 0 |
| 36.47 | 0 |
| 36.48 | 0 |
| 36.49 | 0 |
| 36.5 | 0 |
| 36.51 | 0 |
| 36.52 | 0 |
| 36.53 | 0 |
| 36.54 | 0 |
| 36.55 | 0 |
| 36.56 | 0 |
| 36.57 | 0 |
| 36.58 | 0 |
| 36.59 | 0 |
| 36.6 | 0 |
| 36.61 | 0 |
| 36.62 | 0 |
| 36.63 | 0 |
| 36.64 | 0 |
| 36.65 | 0 |
| 36.66 | 0 |
| 36.67 | 0 |
| 36.68 | 0 |
| 36.69 | 0 |
| 36.7 | 0 |
| 36.71 | 0 |
| 36.72 | 0 |
| 36.73 | 0 |
| 36.74 | 0 |
| 36.75 | 0 |
| 36.76 | 0 |
| 36.77 | 0 |
| 36.78 | 0 |
| 36.79 | 0 |
| 36.8 | 0 |
| 36.81 | 0 |
| 36.82 | 0 |
| 36.83 | 0 |
| 36.84 | 0 |
| 36.85 | 0 |
| 36.86 | 0 |
| 36.87 | 0 |
| 36.88 | 0 |
| 36.89 | 0 |
| 36.9 | 0 |
| 36.91 | 0 |
| 36.92 | 0 |
| 36.93 | 0 |
| 36.94 | 0 |
| 36.95 | 0 |
| 36.96 | 0 |
| 36.97 | 0 |
| 36.98 | 0 |
| 36.99 | 0 |
| 37.0 | 0 |
| 37.01 | 0 |
| 37.02 | 0 |
| 37.03 | 0 |
| 37.04 | 0 |
| 37.05 | 0 |
| 37.06 | 0 |
| 37.07 | 0 |
| 37.08 | 0 |
| 37.09 | 0 |
| 37.1 | 0 |
| 37.11 | 0 |
| 37.12 | 0 |
| 37.13 | 0 |
| 37.14 | 0 |
| 37.15 | 0 |
| 37.16 | 0 |
| 37.17 | 0 |
| 37.18 | 0 |
| 37.19 | 0 |
| 37.2 | 0 |
| 37.21 | 0 |
| 37.22 | 0 |
| 37.23 | 0 |
| 37.24 | 0 |
| 37.25 | 0 |
| 37.26 | 0 |
| 37.27 | 0 |
| 37.28 | 0 |
| 37.29 | 0 |
| 37.3 | 0 |
| 37.31 | 0 |
| 37.32 | 0 |
| 37.33 | 0 |
| 37.34 | 0 |
| 37.35 | 0 |
| 37.36 | 0 |
| 37.37 | 0 |
| 37.38 | 0 |
| 37.39 | 0 |
| 37.4 | 0 |
| 37.41 | 0 |
| 37.42 | 0 |
| 37.43 | 0 |
| 37.44 | 0 |
| 37.45 | 0 |
| 37.46 | 0 |
| 37.47 | 0 |
| 37.48 | 0 |
| 37.49 | 0 |
| 37.5 | 0 |
| 37.51 | 0 |
| 37.52 | 0 |
| 37.53 | 0 |
| 37.54 | 0 |
| 37.55 | 0 |
| 37.56 | 0 |
| 37.57 | 0 |
| 37.58 | 0 |
| 37.59 | 0 |
| 37.6 | 0 |
| 37.61 | 0 |
| 37.62 | 0 |
| 37.63 | 0 |
| 37.64 | 0 |
| 37.65 | 0 |
| 37.66 | 0 |
| 37.67 | 0 |
| 37.68 | 0 |
| 37.69 | 0 |
| 37.7 | 0 |
| 37.71 | 0 |
| 37.72 | 0 |
| 37.73 | 0 |
| 37.74 | 0 |
| 37.75 | 0 |
| 37.76 | 0 |
| 37.77 | 0 |
| 37.78 | 0 |
| 37.79 | 0 |
| 37.8 | 0 |
| 37.81 | 0 |
| 37.82 | 0 |
| 37.83 | 0 |
| 37.84 | 0 |
| 37.85 | 0 |
| 37.86 | 0 |
| 37.87 | 0 |
| 37.88 | 0 |
| 37.89 | 0 |
| 37.9 | 0 |
| 37.91 | 0 |
| 37.92 | 0 |
| 37.93 | 0 |
| 37.94 | 0 |
| 37.95 | 0 |
| 37.96 | 0 |
| 37.97 | 0 |
| 37.98 | 0 |
| 37.99 | 0 |
| 38.0 | 0 |
| 38.01 | 0 |
| 38.02 | 0 |
| 38.03 | 0 |
| 38.04 | 0 |
| 38.05 | 0 |
| 38.06 | 0 |
| 38.07 | 0 |
| 38.08 | 0 |
| 38.09 | 0 |
| 38.1 | 0 |
| 38.11 | 0 |
| 38.12 | 0 |
| 38.13 | 0 |
| 38.14 | 0 |
| 38.15 | 0 |
| 38.16 | 0 |
| 38.17 | 0 |
| 38.18 | 0 |
| 38.19 | 0 |
| 38.2 | 0 |
| 38.21 | 0 |
| 38.22 | 0 |
| 38.23 | 0 |
| 38.24 | 0 |
| 38.25 | 0 |
| 38.26 | 0 |
| 38.27 | 0 |
| 38.28 | 0 |
| 38.29 | 0 |
| 38.3 | 0 |
| 38.31 | 0 |
| 38.32 | 0 |
| 38.33 | 0 |
| 38.34 | 0 |
| 38.35 | 0 |
| 38.36 | 0 |
| 38.37 | 0 |
| 38.38 | 0 |
| 38.39 | 0 |
| 38.4 | 0 |
| 38.41 | 0 |
| 38.42 | 0 |
| 38.43 | 0 |
| 38.44 | 0 |
| 38.45 | 0 |
| 38.46 | 0 |
| 38.47 | 0 |
| 38.48 | 0 |
| 38.49 | 0 |
| 38.5 | 0 |
| 38.51 | 0 |
| 38.52 | 0 |
| 38.53 | 0 |
| 38.54 | 0 |
| 38.55 | 0 |
| 38.56 | 0 |
| 38.57 | 0 |
| 38.58 | 0 |
| 38.59 | 0 |
| 38.6 | 0 |
| 38.61 | 0 |
| 38.62 | 0 |
| 38.63 | 0 |
| 38.64 | 0 |
| 38.65 | 0 |
| 38.66 | 0 |
| 38.67 | 0 |
| 38.68 | 0 |
| 38.69 | 0 |
| 38.7 | 0 |
| 38.71 | 0 |
| 38.72 | 0 |
| 38.73 | 0 |
| 38.74 | 0 |
| 38.75 | 0 |
| 38.76 | 0 |
| 38.77 | 0 |
| 38.78 | 0 |
| 38.79 | 0 |
| 38.8 | 0 |
| 38.81 | 0 |
| 38.82 | 0 |
| 38.83 | 0 |
| 38.84 | 0 |
| 38.85 | 0 |
| 38.86 | 0 |
| 38.87 | 0 |
| 38.88 | 0 |
| 38.89 | 0 |
| 38.9 | 0 |
| 38.91 | 0 |
| 38.92 | 0 |
| 38.93 | 0 |
| 38.94 | 0 |
| 38.95 | 0 |
| 38.96 | 0 |
| 38.97 | 0 |
| 38.98 | 0 |
| 38.99 | 0 |
| 39.0 | 0 |
| 39.01 | 0 |
| 39.02 | 0 |
| 39.03 | 0 |
| 39.04 | 0 |
| 39.05 | 0 |
| 39.06 | 0 |
| 39.07 | 0 |
| 39.08 | 0 |
| 39.09 | 0 |
| 39.1 | 0 |
| 39.11 | 0 |
| 39.12 | 0 |
| 39.13 | 0 |
| 39.14 | 0 |
| 39.15 | 0 |
| 39.16 | 0 |
| 39.17 | 0 |
| 39.18 | 0 |
| 39.19 | 0 |
| 39.2 | 0 |
| 39.21 | 0 |
| 39.22 | 0 |
| 39.23 | 0 |
| 39.24 | 0 |
| 39.25 | 0 |
| 39.26 | 0 |
| 39.27 | 0 |
| 39.28 | 0 |
| 39.29 | 0 |
| 39.3 | 0 |
| 39.31 | 0 |
| 39.32 | 0 |
| 39.33 | 0 |
| 39.34 | 0 |
| 39.35 | 0 |
| 39.36 | 0 |
| 39.37 | 0 |
| 39.38 | 0 |
| 39.39 | 0 |
| 39.4 | 0 |
| 39.41 | 0 |
| 39.42 | 0 |
| 39.43 | 0 |
| 39.44 | 0 |
| 39.45 | 0 |
| 39.46 | 0 |
| 39.47 | 0 |
| 39.48 | 0 |
| 39.49 | 0 |
| 39.5 | 0 |
| 39.51 | 0 |
| 39.52 | 0 |
| 39.53 | 0 |
| 39.54 | 0 |
| 39.55 | 0 |
| 39.56 | 0 |
| 39.57 | 0 |
| 39.58 | 0 |
| 39.59 | 0 |
| 39.6 | 0 |
| 39.61 | 0 |
| 39.62 | 0 |
| 39.63 | 0 |
| 39.64 | 0 |
| 39.65 | 0 |
| 39.66 | 0 |
| 39.67 | 0 |
| 39.68 | 0 |
| 39.69 | 0 |
| 39.7 | 0 |
| 39.71 | 0 |
| 39.72 | 0 |
| 39.73 | 0 |
| 39.74 | 0 |
| 39.75 | 0 |
| 39.76 | 0 |
| 39.77 | 0 |
| 39.78 | 0 |
| 39.79 | 0 |
| 39.8 | 0 |
| 39.81 | 0 |
| 39.82 | 0 |
| 39.83 | 0 |
| 39.84 | 0 |
| 39.85 | 0 |
| 39.86 | 0 |
| 39.87 | 0 |
| 39.88 | 0 |
| 39.89 | 0 |
| 39.9 | 0 |
| 39.91 | 0 |
| 39.92 | 0 |
| 39.93 | 0 |
| 39.94 | 0 |
| 39.95 | 0 |
| 39.96 | 0 |
| 39.97 | 0 |
| 39.98 | 0 |
| 39.99 | 0 |
| 40.0 | 0 |
| 40.01 | 0 |
| 40.02 | 0 |
| 40.03 | 0 |
| 40.04 | 0 |
| 40.05 | 0 |
| 40.06 | 0 |
| 40.07 | 0 |
| 40.08 | 0 |
| 40.09 | 0 |
| 40.1 | 0 |
| 40.11 | 0 |
| 40.12 | 0 |
| 40.13 | 0 |
| 40.14 | 0 |
| 40.15 | 0 |
| 40.16 | 0 |
| 40.17 | 0 |
| 40.18 | 0 |
| 40.19 | 0 |
| 40.2 | 0 |
| 40.21 | 0 |
| 40.22 | 0 |
| 40.23 | 0 |
| 40.24 | 0 |
| 40.25 | 0 |
| 40.26 | 0 |
| 40.27 | 0 |
| 40.28 | 0 |
| 40.29 | 0 |
| 40.3 | 0 |
| 40.31 | 0 |
| 40.32 | 0 |
| 40.33 | 0 |
| 40.34 | 0 |
| 40.35 | 0 |
| 40.36 | 0 |
| 40.37 | 0 |
| 40.38 | 0 |
| 40.39 | 0 |
| 40.4 | 0 |
| 40.41 | 0 |
| 40.42 | 0 |
| 40.43 | 0 |
| 40.44 | 0 |
| 40.45 | 0 |
| 40.46 | 0 |
| 40.47 | 0 |
| 40.48 | 0 |
| 40.49 | 0 |
| 40.5 | 0 |
| 40.51 | 0 |
| 40.52 | 0 |
| 40.53 | 0 |
| 40.54 | 0 |
| 40.55 | 0 |
| 40.56 | 0 |
| 40.57 | 0 |
| 40.58 | 0 |
| 40.59 | 0 |
| 40.6 | 0 |
| 40.61 | 0 |
| 40.62 | 0 |
| 40.63 | 0 |
| 40.64 | 0 |
| 40.65 | 0 |
| 40.66 | 0 |
| 40.67 | 0 |
| 40.68 | 0 |
| 40.69 | 0 |
| 40.7 | 0 |
| 40.71 | 0 |
| 40.72 | 0 |
| 40.73 | 0 |
| 40.74 | 0 |
| 40.75 | 0 |
| 40.76 | 0 |
| 40.77 | 0 |
| 40.78 | 0 |
| 40.79 | 0 |
| 40.8 | 0 |
| 40.81 | 0 |
| 40.82 | 0 |
| 40.83 | 0 |
| 40.84 | 0 |
| 40.85 | 0 |
| 40.86 | 0 |
| 40.87 | 0 |
| 40.88 | 0 |
| 40.89 | 0 |
| 40.9 | 0 |
| 40.91 | 0 |
| 40.92 | 0 |
| 40.93 | 0 |
| 40.94 | 0 |
| 40.95 | 0 |